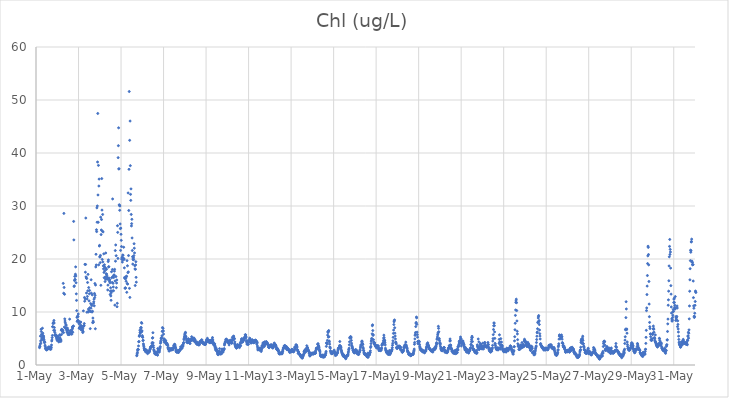
| Category | Chl (ug/L) |
|---|---|
| 44682.166666666664 | 3.27 |
| 44682.177083333336 | 3.56 |
| 44682.1875 | 3.55 |
| 44682.197916666664 | 3.96 |
| 44682.208333333336 | 5.44 |
| 44682.21875 | 4.54 |
| 44682.229166666664 | 4.12 |
| 44682.239583333336 | 6.75 |
| 44682.25 | 6.32 |
| 44682.260416666664 | 5.79 |
| 44682.270833333336 | 4.94 |
| 44682.28125 | 4.76 |
| 44682.291666666664 | 5.26 |
| 44682.302083333336 | 6.94 |
| 44682.3125 | 5.59 |
| 44682.322916666664 | 6.01 |
| 44682.333333333336 | 5.26 |
| 44682.34375 | 5.48 |
| 44682.354166666664 | 5.43 |
| 44682.364583333336 | 5.1 |
| 44682.375 | 4.79 |
| 44682.385416666664 | 4.5 |
| 44682.395833333336 | 4.22 |
| 44682.40625 | 4.32 |
| 44682.416666666664 | 4.3 |
| 44682.427083333336 | 3.72 |
| 44682.4375 | 3.47 |
| 44682.447916666664 | 3.14 |
| 44682.458333333336 | 3.14 |
| 44682.46875 | 2.98 |
| 44682.479166666664 | 2.96 |
| 44682.489583333336 | 3.05 |
| 44682.5 | 2.82 |
| 44682.510416666664 | 3.02 |
| 44682.520833333336 | 2.94 |
| 44682.53125 | 3.08 |
| 44682.541666666664 | 3.06 |
| 44682.552083333336 | 3.14 |
| 44682.5625 | 3.05 |
| 44682.572916666664 | 3.16 |
| 44682.583333333336 | 3.36 |
| 44682.59375 | 3.09 |
| 44682.604166666664 | 3.12 |
| 44682.614583333336 | 3.43 |
| 44682.625 | 3.04 |
| 44682.635416666664 | 3.17 |
| 44682.645833333336 | 3.28 |
| 44682.65625 | 3.15 |
| 44682.666666666664 | 3.34 |
| 44682.677083333336 | 3.04 |
| 44682.6875 | 2.95 |
| 44682.697916666664 | 3.34 |
| 44682.708333333336 | 3.04 |
| 44682.71875 | 3.36 |
| 44682.729166666664 | 3.77 |
| 44682.739583333336 | 4.53 |
| 44682.75 | 4.72 |
| 44682.760416666664 | 5.16 |
| 44682.770833333336 | 5.57 |
| 44682.78125 | 7.23 |
| 44682.791666666664 | 7.21 |
| 44682.802083333336 | 7.83 |
| 44682.8125 | 7.94 |
| 44682.822916666664 | 8.03 |
| 44682.833333333336 | 6.54 |
| 44682.84375 | 8.4 |
| 44682.854166666664 | 7.92 |
| 44682.864583333336 | 7.07 |
| 44682.875 | 6.54 |
| 44682.885416666664 | 6.16 |
| 44682.895833333336 | 5.75 |
| 44682.90625 | 5.6 |
| 44682.916666666664 | 5.53 |
| 44682.927083333336 | 5.58 |
| 44682.9375 | 5.53 |
| 44682.947916666664 | 5.66 |
| 44682.958333333336 | 5.31 |
| 44682.96875 | 5.07 |
| 44682.979166666664 | 4.87 |
| 44682.989583333336 | 5.17 |
| 44683.0 | 4.6 |
| 44683.010416666664 | 5.34 |
| 44683.020833333336 | 5.34 |
| 44683.03125 | 5.22 |
| 44683.041666666664 | 5.42 |
| 44683.052083333336 | 4.84 |
| 44683.0625 | 4.9 |
| 44683.072916666664 | 4.35 |
| 44683.083333333336 | 4.69 |
| 44683.09375 | 4.76 |
| 44683.104166666664 | 4.56 |
| 44683.114583333336 | 5.7 |
| 44683.125 | 5.11 |
| 44683.135416666664 | 4.97 |
| 44683.145833333336 | 5.6 |
| 44683.15625 | 4.77 |
| 44683.166666666664 | 4.44 |
| 44683.177083333336 | 4.69 |
| 44683.1875 | 6.58 |
| 44683.197916666664 | 5.74 |
| 44683.208333333336 | 6.73 |
| 44683.21875 | 6.59 |
| 44683.229166666664 | 6.44 |
| 44683.239583333336 | 6.52 |
| 44683.25 | 6.62 |
| 44683.260416666664 | 6.2 |
| 44683.270833333336 | 6.45 |
| 44683.28125 | 15.4 |
| 44683.291666666664 | 6.1 |
| 44683.302083333336 | 13.54 |
| 44683.3125 | 28.6 |
| 44683.322916666664 | 14.63 |
| 44683.333333333336 | 7.15 |
| 44683.34375 | 13.34 |
| 44683.354166666664 | 8.7 |
| 44683.364583333336 | 8.3 |
| 44683.375 | 7.97 |
| 44683.385416666664 | 7 |
| 44683.395833333336 | 7 |
| 44683.40625 | 7.64 |
| 44683.416666666664 | 7.47 |
| 44683.427083333336 | 6.72 |
| 44683.4375 | 6.97 |
| 44683.447916666664 | 6.57 |
| 44683.458333333336 | 6.25 |
| 44683.46875 | 6.11 |
| 44683.479166666664 | 6.96 |
| 44683.489583333336 | 6.58 |
| 44683.5 | 6.6 |
| 44683.510416666664 | 5.72 |
| 44683.520833333336 | 6.01 |
| 44683.53125 | 6.09 |
| 44683.541666666664 | 5.85 |
| 44683.552083333336 | 5.93 |
| 44683.5625 | 5.76 |
| 44683.572916666664 | 5.83 |
| 44683.583333333336 | 8.65 |
| 44683.59375 | 6.03 |
| 44683.604166666664 | 6.1 |
| 44683.614583333336 | 6.48 |
| 44683.625 | 6.42 |
| 44683.635416666664 | 6.01 |
| 44683.645833333336 | 5.84 |
| 44683.65625 | 5.87 |
| 44683.666666666664 | 6.4 |
| 44683.677083333336 | 6.3 |
| 44683.6875 | 5.83 |
| 44683.697916666664 | 6.65 |
| 44683.708333333336 | 7.16 |
| 44683.71875 | 6.94 |
| 44683.729166666664 | 6.18 |
| 44683.739583333336 | 7.26 |
| 44683.75 | 7.34 |
| 44683.760416666664 | 7.33 |
| 44683.770833333336 | 27.09 |
| 44683.78125 | 23.6 |
| 44683.791666666664 | 14.82 |
| 44683.802083333336 | 14.93 |
| 44683.8125 | 15.94 |
| 44683.822916666664 | 16.72 |
| 44683.833333333336 | 16.16 |
| 44683.84375 | 16.06 |
| 44683.854166666664 | 17.13 |
| 44683.864583333336 | 18.51 |
| 44683.875 | 16.79 |
| 44683.885416666664 | 15.51 |
| 44683.895833333336 | 13.42 |
| 44683.90625 | 12.19 |
| 44683.916666666664 | 10.25 |
| 44683.927083333336 | 8.98 |
| 44683.9375 | 8.21 |
| 44683.947916666664 | 9.19 |
| 44683.958333333336 | 8.34 |
| 44683.96875 | 8.45 |
| 44683.979166666664 | 9.13 |
| 44683.989583333336 | 9.62 |
| 44684.0 | 8.27 |
| 44684.010416666664 | 8.22 |
| 44684.020833333336 | 7.8 |
| 44684.03125 | 6.94 |
| 44684.041666666664 | 6.96 |
| 44684.052083333336 | 6.99 |
| 44684.0625 | 7 |
| 44684.072916666664 | 7.19 |
| 44684.083333333336 | 7.98 |
| 44684.09375 | 7.51 |
| 44684.104166666664 | 8.11 |
| 44684.114583333336 | 7.12 |
| 44684.125 | 6.63 |
| 44684.135416666664 | 7 |
| 44684.145833333336 | 7.37 |
| 44684.15625 | 6.72 |
| 44684.166666666664 | 6.58 |
| 44684.177083333336 | 6.59 |
| 44684.1875 | 6.56 |
| 44684.197916666664 | 6.13 |
| 44684.208333333336 | 6.95 |
| 44684.21875 | 6.27 |
| 44684.229166666664 | 10.21 |
| 44684.239583333336 | 7.3 |
| 44684.25 | 7.4 |
| 44684.260416666664 | 7.43 |
| 44684.270833333336 | 7.82 |
| 44684.28125 | 12.74 |
| 44684.291666666664 | 12.04 |
| 44684.302083333336 | 18.99 |
| 44684.3125 | 12.48 |
| 44684.322916666664 | 17.51 |
| 44684.333333333336 | 18.97 |
| 44684.34375 | 27.73 |
| 44684.354166666664 | 16.63 |
| 44684.364583333336 | 16.42 |
| 44684.375 | 13.58 |
| 44684.385416666664 | 16.32 |
| 44684.395833333336 | 9.96 |
| 44684.40625 | 12.45 |
| 44684.416666666664 | 12.93 |
| 44684.427083333336 | 15.57 |
| 44684.4375 | 14 |
| 44684.447916666664 | 17.1 |
| 44684.458333333336 | 10 |
| 44684.46875 | 10.55 |
| 44684.479166666664 | 14.61 |
| 44684.489583333336 | 10.3 |
| 44684.5 | 12.09 |
| 44684.510416666664 | 13.44 |
| 44684.520833333336 | 14.06 |
| 44684.53125 | 10.81 |
| 44684.541666666664 | 10.13 |
| 44684.552083333336 | 6.86 |
| 44684.5625 | 10.1 |
| 44684.572916666664 | 11.58 |
| 44684.583333333336 | 10.71 |
| 44684.59375 | 16.08 |
| 44684.604166666664 | 13.55 |
| 44684.614583333336 | 11.41 |
| 44684.625 | 11.21 |
| 44684.635416666664 | 9.99 |
| 44684.645833333336 | 13.23 |
| 44684.65625 | 10.14 |
| 44684.666666666664 | 7.99 |
| 44684.677083333336 | 8.86 |
| 44684.6875 | 8.28 |
| 44684.697916666664 | 8.06 |
| 44684.708333333336 | 11.63 |
| 44684.71875 | 11.92 |
| 44684.729166666664 | 12.42 |
| 44684.739583333336 | 11.17 |
| 44684.75 | 13.5 |
| 44684.760416666664 | 12.72 |
| 44684.770833333336 | 15.37 |
| 44684.78125 | 13.15 |
| 44684.791666666664 | 6.84 |
| 44684.802083333336 | 15.09 |
| 44684.8125 | 18.5 |
| 44684.822916666664 | 20.89 |
| 44684.833333333336 | 18.87 |
| 44684.84375 | 25.52 |
| 44684.854166666664 | 25.17 |
| 44684.864583333336 | 29.65 |
| 44684.875 | 26.94 |
| 44684.885416666664 | 30.01 |
| 44684.895833333336 | 38.3 |
| 44684.90625 | 47.46 |
| 44684.916666666664 | 32.08 |
| 44684.927083333336 | 26.93 |
| 44684.9375 | 37.66 |
| 44684.947916666664 | 18.89 |
| 44684.958333333336 | 33.77 |
| 44684.96875 | 35.08 |
| 44684.979166666664 | 22.45 |
| 44684.989583333336 | 22.57 |
| 44685.0 | 20.42 |
| 44685.010416666664 | 20.37 |
| 44685.020833333336 | 19.31 |
| 44685.03125 | 20.68 |
| 44685.041666666664 | 27.89 |
| 44685.052083333336 | 15.04 |
| 44685.0625 | 24.61 |
| 44685.072916666664 | 25.47 |
| 44685.083333333336 | 27.45 |
| 44685.09375 | 35.17 |
| 44685.104166666664 | 29.23 |
| 44685.114583333336 | 19.92 |
| 44685.125 | 25.24 |
| 44685.135416666664 | 28.4 |
| 44685.145833333336 | 19.45 |
| 44685.15625 | 25.11 |
| 44685.166666666664 | 18.7 |
| 44685.177083333336 | 18.14 |
| 44685.1875 | 20.97 |
| 44685.197916666664 | 17.47 |
| 44685.208333333336 | 16.47 |
| 44685.21875 | 18.91 |
| 44685.229166666664 | 18.5 |
| 44685.239583333336 | 17.78 |
| 44685.25 | 15.75 |
| 44685.260416666664 | 16.6 |
| 44685.270833333336 | 16.21 |
| 44685.28125 | 21.13 |
| 44685.291666666664 | 18.23 |
| 44685.302083333336 | 17.21 |
| 44685.3125 | 18.04 |
| 44685.322916666664 | 17.13 |
| 44685.333333333336 | 16.84 |
| 44685.34375 | 16.16 |
| 44685.354166666664 | 16.57 |
| 44685.364583333336 | 16.37 |
| 44685.375 | 14.16 |
| 44685.385416666664 | 15.07 |
| 44685.395833333336 | 19.52 |
| 44685.40625 | 19.82 |
| 44685.416666666664 | 18.5 |
| 44685.427083333336 | 18.55 |
| 44685.4375 | 16.4 |
| 44685.447916666664 | 16.06 |
| 44685.458333333336 | 15.77 |
| 44685.46875 | 16.07 |
| 44685.479166666664 | 15.5 |
| 44685.489583333336 | 13.31 |
| 44685.5 | 13.95 |
| 44685.510416666664 | 14.57 |
| 44685.520833333336 | 13.03 |
| 44685.53125 | 12.21 |
| 44685.541666666664 | 13.63 |
| 44685.552083333336 | 17.6 |
| 44685.5625 | 16.47 |
| 44685.572916666664 | 14 |
| 44685.583333333336 | 15.58 |
| 44685.59375 | 18.02 |
| 44685.604166666664 | 31.33 |
| 44685.614583333336 | 16.7 |
| 44685.625 | 15.41 |
| 44685.635416666664 | 14.72 |
| 44685.645833333336 | 14.01 |
| 44685.65625 | 16.52 |
| 44685.666666666664 | 16.97 |
| 44685.677083333336 | 16.97 |
| 44685.6875 | 17.71 |
| 44685.697916666664 | 18.05 |
| 44685.708333333336 | 11.3 |
| 44685.71875 | 15.85 |
| 44685.729166666664 | 21.59 |
| 44685.739583333336 | 19.59 |
| 44685.75 | 22.65 |
| 44685.760416666664 | 16.69 |
| 44685.770833333336 | 20.62 |
| 44685.78125 | 14.59 |
| 44685.791666666664 | 15.47 |
| 44685.802083333336 | 16.04 |
| 44685.8125 | 11 |
| 44685.822916666664 | 11.64 |
| 44685.833333333336 | 26.28 |
| 44685.84375 | 25.02 |
| 44685.854166666664 | 20.11 |
| 44685.864583333336 | 39.12 |
| 44685.875 | 41.38 |
| 44685.885416666664 | 44.75 |
| 44685.895833333336 | 36.99 |
| 44685.90625 | 37.02 |
| 44685.916666666664 | 30.23 |
| 44685.927083333336 | 30.1 |
| 44685.9375 | 29.19 |
| 44685.947916666664 | 30 |
| 44685.958333333336 | 26.61 |
| 44685.96875 | 25.73 |
| 44685.979166666664 | 21.62 |
| 44685.989583333336 | 25.83 |
| 44686.0 | 24.66 |
| 44686.010416666664 | 23.52 |
| 44686.020833333336 | 22.35 |
| 44686.03125 | 19.97 |
| 44686.041666666664 | 20.2 |
| 44686.052083333336 | 20.36 |
| 44686.0625 | 19.42 |
| 44686.072916666664 | 19.86 |
| 44686.083333333336 | 20.76 |
| 44686.09375 | 20.69 |
| 44686.104166666664 | 20.04 |
| 44686.114583333336 | 20.11 |
| 44686.125 | 22.22 |
| 44686.135416666664 | 19.91 |
| 44686.145833333336 | 20.01 |
| 44686.15625 | 18.33 |
| 44686.166666666664 | 16.52 |
| 44686.177083333336 | 16.34 |
| 44686.1875 | 14.48 |
| 44686.197916666664 | 14.55 |
| 44686.208333333336 | 14.52 |
| 44686.21875 | 16.3 |
| 44686.229166666664 | 16.51 |
| 44686.239583333336 | 15.8 |
| 44686.25 | 16.72 |
| 44686.260416666664 | 16.74 |
| 44686.270833333336 | 13.71 |
| 44686.28125 | 19.69 |
| 44686.291666666664 | 15.37 |
| 44686.302083333336 | 18.72 |
| 44686.3125 | 15.26 |
| 44686.322916666664 | 17.44 |
| 44686.333333333336 | 32.46 |
| 44686.34375 | 17.57 |
| 44686.354166666664 | 20.65 |
| 44686.364583333336 | 29.15 |
| 44686.375 | 36.92 |
| 44686.385416666664 | 51.6 |
| 44686.395833333336 | 14.46 |
| 44686.40625 | 42.39 |
| 44686.416666666664 | 12.75 |
| 44686.427083333336 | 46.03 |
| 44686.4375 | 37.61 |
| 44686.447916666664 | 32.2 |
| 44686.458333333336 | 31.06 |
| 44686.46875 | 33.23 |
| 44686.479166666664 | 28.41 |
| 44686.489583333336 | 26.24 |
| 44686.5 | 26.67 |
| 44686.510416666664 | 27.49 |
| 44686.520833333336 | 23.97 |
| 44686.53125 | 21.6 |
| 44686.541666666664 | 20.44 |
| 44686.552083333336 | 19.04 |
| 44686.5625 | 20.01 |
| 44686.572916666664 | 19.86 |
| 44686.583333333336 | 20.24 |
| 44686.59375 | 19.9 |
| 44686.604166666664 | 20.63 |
| 44686.614583333336 | 22.88 |
| 44686.625 | 22.04 |
| 44686.635416666664 | 21.15 |
| 44686.645833333336 | 18.74 |
| 44686.65625 | 18.13 |
| 44686.666666666664 | 15 |
| 44686.677083333336 | 18.05 |
| 44686.6875 | 18.88 |
| 44686.697916666664 | 19.49 |
| 44686.708333333336 | 16.54 |
| 44686.71875 | 15.63 |
| 44686.739583333336 | 1.74 |
| 44686.75 | 1.88 |
| 44686.760416666664 | 2.13 |
| 44686.770833333336 | 2.38 |
| 44686.78125 | 2.75 |
| 44686.791666666664 | 2.97 |
| 44686.802083333336 | 2.91 |
| 44686.8125 | 2.92 |
| 44686.822916666664 | 3.6 |
| 44686.833333333336 | 4.38 |
| 44686.84375 | 4.42 |
| 44686.854166666664 | 5.46 |
| 44686.864583333336 | 5.43 |
| 44686.875 | 5.64 |
| 44686.885416666664 | 6.57 |
| 44686.895833333336 | 6.11 |
| 44686.90625 | 6.04 |
| 44686.916666666664 | 6.27 |
| 44686.927083333336 | 7.04 |
| 44686.9375 | 6.83 |
| 44686.947916666664 | 7.08 |
| 44686.958333333336 | 8.01 |
| 44686.96875 | 6.25 |
| 44686.979166666664 | 7.87 |
| 44686.989583333336 | 6.43 |
| 44687.0 | 5.55 |
| 44687.010416666664 | 5.26 |
| 44687.020833333336 | 5.24 |
| 44687.03125 | 4.6 |
| 44687.041666666664 | 4.68 |
| 44687.052083333336 | 3.99 |
| 44687.0625 | 3.74 |
| 44687.072916666664 | 3.47 |
| 44687.083333333336 | 3.19 |
| 44687.09375 | 3.03 |
| 44687.104166666664 | 2.78 |
| 44687.114583333336 | 2.96 |
| 44687.125 | 2.87 |
| 44687.135416666664 | 2.73 |
| 44687.145833333336 | 2.93 |
| 44687.15625 | 2.47 |
| 44687.166666666664 | 2.65 |
| 44687.177083333336 | 2.7 |
| 44687.1875 | 2.74 |
| 44687.197916666664 | 2.81 |
| 44687.208333333336 | 2.64 |
| 44687.21875 | 2.44 |
| 44687.229166666664 | 2.37 |
| 44687.239583333336 | 2.55 |
| 44687.25 | 2.14 |
| 44687.260416666664 | 2.36 |
| 44687.270833333336 | 2.44 |
| 44687.28125 | 2.4 |
| 44687.291666666664 | 2.55 |
| 44687.302083333336 | 2.4 |
| 44687.3125 | 2.4 |
| 44687.322916666664 | 2.47 |
| 44687.333333333336 | 2.6 |
| 44687.34375 | 2.65 |
| 44687.354166666664 | 2.89 |
| 44687.364583333336 | 3.02 |
| 44687.375 | 3.05 |
| 44687.385416666664 | 3.29 |
| 44687.395833333336 | 3.42 |
| 44687.40625 | 3.45 |
| 44687.416666666664 | 3.42 |
| 44687.427083333336 | 3.43 |
| 44687.4375 | 3.51 |
| 44687.447916666664 | 3.59 |
| 44687.458333333336 | 4.03 |
| 44687.46875 | 4.23 |
| 44687.479166666664 | 5.07 |
| 44687.489583333336 | 5.16 |
| 44687.5 | 6.09 |
| 44687.510416666664 | 4.17 |
| 44687.520833333336 | 3.67 |
| 44687.53125 | 3.3 |
| 44687.541666666664 | 2.88 |
| 44687.552083333336 | 2.72 |
| 44687.5625 | 2.62 |
| 44687.572916666664 | 2.48 |
| 44687.583333333336 | 2.22 |
| 44687.59375 | 2.16 |
| 44687.604166666664 | 2.1 |
| 44687.614583333336 | 2.03 |
| 44687.625 | 2.08 |
| 44687.635416666664 | 2.27 |
| 44687.645833333336 | 2.4 |
| 44687.65625 | 2.27 |
| 44687.666666666664 | 2 |
| 44687.677083333336 | 2.27 |
| 44687.6875 | 2.07 |
| 44687.697916666664 | 2.26 |
| 44687.708333333336 | 1.92 |
| 44687.71875 | 1.86 |
| 44687.729166666664 | 3.1 |
| 44687.739583333336 | 2.78 |
| 44687.75 | 2.45 |
| 44687.760416666664 | 2.57 |
| 44687.770833333336 | 2.94 |
| 44687.78125 | 2.73 |
| 44687.791666666664 | 2.44 |
| 44687.802083333336 | 2.49 |
| 44687.8125 | 2.84 |
| 44687.822916666664 | 3.14 |
| 44687.833333333336 | 3.27 |
| 44687.84375 | 3.48 |
| 44687.854166666664 | 4.11 |
| 44687.864583333336 | 4.52 |
| 44687.875 | 4.33 |
| 44687.885416666664 | 4.96 |
| 44687.895833333336 | 5.13 |
| 44687.90625 | 4.99 |
| 44687.916666666664 | 5.04 |
| 44687.927083333336 | 5.52 |
| 44687.9375 | 6.34 |
| 44687.947916666664 | 7.06 |
| 44687.958333333336 | 6.37 |
| 44687.96875 | 6.38 |
| 44687.979166666664 | 6.92 |
| 44687.989583333336 | 6.43 |
| 44688.0 | 5.83 |
| 44688.010416666664 | 4.6 |
| 44688.020833333336 | 4.96 |
| 44688.03125 | 4.67 |
| 44688.041666666664 | 4.29 |
| 44688.052083333336 | 4.55 |
| 44688.0625 | 4.76 |
| 44688.072916666664 | 4.63 |
| 44688.083333333336 | 4.38 |
| 44688.09375 | 4.24 |
| 44688.104166666664 | 4.57 |
| 44688.114583333336 | 4.28 |
| 44688.125 | 4.12 |
| 44688.135416666664 | 3.87 |
| 44688.145833333336 | 4.03 |
| 44688.15625 | 3.95 |
| 44688.166666666664 | 4.07 |
| 44688.177083333336 | 3.85 |
| 44688.1875 | 3.81 |
| 44688.197916666664 | 3.65 |
| 44688.208333333336 | 3.28 |
| 44688.21875 | 3.05 |
| 44688.229166666664 | 3.14 |
| 44688.239583333336 | 2.92 |
| 44688.25 | 3.11 |
| 44688.260416666664 | 2.61 |
| 44688.270833333336 | 2.72 |
| 44688.28125 | 3.16 |
| 44688.291666666664 | 2.89 |
| 44688.302083333336 | 3.02 |
| 44688.3125 | 2.96 |
| 44688.322916666664 | 2.81 |
| 44688.333333333336 | 2.99 |
| 44688.34375 | 3.01 |
| 44688.354166666664 | 2.96 |
| 44688.364583333336 | 2.84 |
| 44688.375 | 3.01 |
| 44688.385416666664 | 3.1 |
| 44688.395833333336 | 2.86 |
| 44688.40625 | 2.95 |
| 44688.416666666664 | 3.11 |
| 44688.427083333336 | 3.1 |
| 44688.4375 | 2.89 |
| 44688.447916666664 | 3.11 |
| 44688.458333333336 | 3.07 |
| 44688.46875 | 3.3 |
| 44688.479166666664 | 3.57 |
| 44688.489583333336 | 3.73 |
| 44688.5 | 3.74 |
| 44688.510416666664 | 3.83 |
| 44688.520833333336 | 3.91 |
| 44688.53125 | 3.86 |
| 44688.541666666664 | 3.64 |
| 44688.552083333336 | 3.41 |
| 44688.5625 | 3.29 |
| 44688.572916666664 | 3.08 |
| 44688.583333333336 | 2.74 |
| 44688.59375 | 2.55 |
| 44688.604166666664 | 2.5 |
| 44688.614583333336 | 2.57 |
| 44688.625 | 2.39 |
| 44688.635416666664 | 2.66 |
| 44688.645833333336 | 2.68 |
| 44688.65625 | 2.68 |
| 44688.666666666664 | 2.49 |
| 44688.677083333336 | 2.4 |
| 44688.6875 | 2.49 |
| 44688.697916666664 | 2.41 |
| 44688.708333333336 | 2.37 |
| 44688.71875 | 2.52 |
| 44688.729166666664 | 2.74 |
| 44688.739583333336 | 2.69 |
| 44688.75 | 2.88 |
| 44688.760416666664 | 2.72 |
| 44688.770833333336 | 2.91 |
| 44688.78125 | 2.8 |
| 44688.791666666664 | 2.94 |
| 44688.802083333336 | 3.43 |
| 44688.8125 | 3.15 |
| 44688.822916666664 | 3.2 |
| 44688.833333333336 | 3.09 |
| 44688.84375 | 3.21 |
| 44688.854166666664 | 3.2 |
| 44688.864583333336 | 3.14 |
| 44688.875 | 3.27 |
| 44688.885416666664 | 3.75 |
| 44688.895833333336 | 3.64 |
| 44688.90625 | 3.6 |
| 44688.916666666664 | 3.58 |
| 44688.927083333336 | 3.95 |
| 44688.9375 | 4.16 |
| 44688.947916666664 | 4.24 |
| 44688.958333333336 | 4.79 |
| 44688.96875 | 4.98 |
| 44688.979166666664 | 5.26 |
| 44688.989583333336 | 5.46 |
| 44689.0 | 5.78 |
| 44689.010416666664 | 5.96 |
| 44689.020833333336 | 6.05 |
| 44689.03125 | 6.16 |
| 44689.041666666664 | 5.45 |
| 44689.052083333336 | 5.33 |
| 44689.0625 | 5.01 |
| 44689.072916666664 | 5.01 |
| 44689.083333333336 | 4.69 |
| 44689.09375 | 4.28 |
| 44689.104166666664 | 4.37 |
| 44689.114583333336 | 4.39 |
| 44689.125 | 4.28 |
| 44689.135416666664 | 4.21 |
| 44689.145833333336 | 4.3 |
| 44689.15625 | 4.53 |
| 44689.166666666664 | 4.94 |
| 44689.177083333336 | 4.88 |
| 44689.1875 | 4.56 |
| 44689.197916666664 | 4.4 |
| 44689.208333333336 | 4.21 |
| 44689.21875 | 4.23 |
| 44689.229166666664 | 4.12 |
| 44689.239583333336 | 4.36 |
| 44689.25 | 4.05 |
| 44689.260416666664 | 4.55 |
| 44689.270833333336 | 4.82 |
| 44689.28125 | 4.56 |
| 44689.291666666664 | 4.69 |
| 44689.302083333336 | 4.79 |
| 44689.3125 | 4.96 |
| 44689.322916666664 | 5.34 |
| 44689.333333333336 | 5.05 |
| 44689.34375 | 4.83 |
| 44689.354166666664 | 4.98 |
| 44689.364583333336 | 5.01 |
| 44689.375 | 4.76 |
| 44689.385416666664 | 4.84 |
| 44689.395833333336 | 4.61 |
| 44689.40625 | 4.85 |
| 44689.416666666664 | 4.85 |
| 44689.427083333336 | 5.1 |
| 44689.4375 | 4.98 |
| 44689.447916666664 | 4.59 |
| 44689.458333333336 | 4.51 |
| 44689.46875 | 4.38 |
| 44689.479166666664 | 4.8 |
| 44689.489583333336 | 4.52 |
| 44689.5 | 4.27 |
| 44689.510416666664 | 4.39 |
| 44689.520833333336 | 4.4 |
| 44689.53125 | 4.32 |
| 44689.541666666664 | 4.18 |
| 44689.552083333336 | 4.03 |
| 44689.5625 | 3.91 |
| 44689.572916666664 | 4.1 |
| 44689.583333333336 | 4.3 |
| 44689.59375 | 4.05 |
| 44689.604166666664 | 3.98 |
| 44689.614583333336 | 3.89 |
| 44689.625 | 4.01 |
| 44689.635416666664 | 3.95 |
| 44689.645833333336 | 3.78 |
| 44689.65625 | 3.91 |
| 44689.666666666664 | 3.91 |
| 44689.677083333336 | 3.8 |
| 44689.6875 | 3.87 |
| 44689.697916666664 | 4.26 |
| 44689.708333333336 | 4.44 |
| 44689.71875 | 4.38 |
| 44689.729166666664 | 4.3 |
| 44689.739583333336 | 4.44 |
| 44689.75 | 4.44 |
| 44689.760416666664 | 4.34 |
| 44689.770833333336 | 4.32 |
| 44689.78125 | 4.71 |
| 44689.791666666664 | 4.41 |
| 44689.802083333336 | 4.75 |
| 44689.8125 | 4.34 |
| 44689.822916666664 | 4.24 |
| 44689.833333333336 | 4.24 |
| 44689.84375 | 4.12 |
| 44689.854166666664 | 4.25 |
| 44689.864583333336 | 4.33 |
| 44689.875 | 4.06 |
| 44689.885416666664 | 4.13 |
| 44689.895833333336 | 3.94 |
| 44689.90625 | 3.97 |
| 44689.916666666664 | 3.95 |
| 44689.927083333336 | 3.98 |
| 44689.9375 | 3.98 |
| 44689.947916666664 | 3.89 |
| 44689.958333333336 | 3.89 |
| 44689.96875 | 3.86 |
| 44689.979166666664 | 3.97 |
| 44689.989583333336 | 4.21 |
| 44690.0 | 4.35 |
| 44690.010416666664 | 4.5 |
| 44690.020833333336 | 4.78 |
| 44690.03125 | 4.51 |
| 44690.041666666664 | 4.34 |
| 44690.052083333336 | 4.53 |
| 44690.0625 | 5.04 |
| 44690.072916666664 | 4.8 |
| 44690.083333333336 | 4.61 |
| 44690.09375 | 4.61 |
| 44690.104166666664 | 4.41 |
| 44690.114583333336 | 4.58 |
| 44690.125 | 4.42 |
| 44690.135416666664 | 4.63 |
| 44690.145833333336 | 4.58 |
| 44690.15625 | 4.24 |
| 44690.166666666664 | 4.55 |
| 44690.177083333336 | 4.21 |
| 44690.1875 | 4.65 |
| 44690.197916666664 | 4.64 |
| 44690.208333333336 | 4.23 |
| 44690.21875 | 4.32 |
| 44690.229166666664 | 4.35 |
| 44690.239583333336 | 4.37 |
| 44690.25 | 4.24 |
| 44690.260416666664 | 4.27 |
| 44690.270833333336 | 4.52 |
| 44690.28125 | 4.58 |
| 44690.291666666664 | 4.86 |
| 44690.302083333336 | 5.18 |
| 44690.3125 | 4.76 |
| 44690.322916666664 | 4.5 |
| 44690.333333333336 | 3.98 |
| 44690.34375 | 4.19 |
| 44690.354166666664 | 4.15 |
| 44690.364583333336 | 3.88 |
| 44690.375 | 3.7 |
| 44690.385416666664 | 3.8 |
| 44690.395833333336 | 3.94 |
| 44690.40625 | 3.99 |
| 44690.416666666664 | 3.64 |
| 44690.427083333336 | 3.34 |
| 44690.4375 | 3.12 |
| 44690.447916666664 | 2.85 |
| 44690.458333333336 | 3.31 |
| 44690.46875 | 2.82 |
| 44690.479166666664 | 2.88 |
| 44690.489583333336 | 2.91 |
| 44690.5 | 2.95 |
| 44690.510416666664 | 2.6 |
| 44690.520833333336 | 2.56 |
| 44690.53125 | 2.43 |
| 44690.541666666664 | 2.2 |
| 44690.552083333336 | 1.98 |
| 44690.5625 | 2.25 |
| 44690.572916666664 | 1.95 |
| 44690.583333333336 | 2.17 |
| 44690.59375 | 2.54 |
| 44690.604166666664 | 2.55 |
| 44690.614583333336 | 2.34 |
| 44690.625 | 2.44 |
| 44690.635416666664 | 3.09 |
| 44690.645833333336 | 2.5 |
| 44690.65625 | 2.09 |
| 44690.666666666664 | 2.06 |
| 44690.677083333336 | 2.25 |
| 44690.6875 | 2.28 |
| 44690.697916666664 | 2.12 |
| 44690.708333333336 | 2.12 |
| 44690.71875 | 2.46 |
| 44690.729166666664 | 2.14 |
| 44690.739583333336 | 2.66 |
| 44690.75 | 3.02 |
| 44690.760416666664 | 2.94 |
| 44690.770833333336 | 2.77 |
| 44690.78125 | 2.61 |
| 44690.791666666664 | 2.62 |
| 44690.802083333336 | 2.44 |
| 44690.8125 | 2.8 |
| 44690.822916666664 | 2.79 |
| 44690.833333333336 | 2.95 |
| 44690.84375 | 2.96 |
| 44690.854166666664 | 3.1 |
| 44690.864583333336 | 3.76 |
| 44690.875 | 3.98 |
| 44690.885416666664 | 4.03 |
| 44690.895833333336 | 4.27 |
| 44690.90625 | 4.38 |
| 44690.916666666664 | 4.42 |
| 44690.927083333336 | 4.74 |
| 44690.9375 | 4.87 |
| 44690.947916666664 | 4.67 |
| 44690.958333333336 | 4.88 |
| 44690.96875 | 4.75 |
| 44690.979166666664 | 4.73 |
| 44690.989583333336 | 4.57 |
| 44691.0 | 4.53 |
| 44691.010416666664 | 4.62 |
| 44691.020833333336 | 4.35 |
| 44691.03125 | 4.29 |
| 44691.041666666664 | 4.52 |
| 44691.052083333336 | 4.15 |
| 44691.0625 | 4.34 |
| 44691.072916666664 | 4.5 |
| 44691.083333333336 | 3.79 |
| 44691.09375 | 4.31 |
| 44691.104166666664 | 4.14 |
| 44691.114583333336 | 4.18 |
| 44691.125 | 4.52 |
| 44691.135416666664 | 4.69 |
| 44691.145833333336 | 4.49 |
| 44691.15625 | 4.5 |
| 44691.166666666664 | 4.4 |
| 44691.177083333336 | 4.39 |
| 44691.1875 | 4.21 |
| 44691.197916666664 | 4.15 |
| 44691.208333333336 | 4.11 |
| 44691.21875 | 4.23 |
| 44691.229166666664 | 4.81 |
| 44691.239583333336 | 5.21 |
| 44691.25 | 4.8 |
| 44691.260416666664 | 4.67 |
| 44691.270833333336 | 5.1 |
| 44691.28125 | 5.39 |
| 44691.291666666664 | 4.99 |
| 44691.302083333336 | 5.45 |
| 44691.3125 | 4.83 |
| 44691.322916666664 | 5.04 |
| 44691.333333333336 | 4.97 |
| 44691.34375 | 4.01 |
| 44691.354166666664 | 4.35 |
| 44691.364583333336 | 3.93 |
| 44691.375 | 3.66 |
| 44691.385416666664 | 3.52 |
| 44691.395833333336 | 3.37 |
| 44691.40625 | 3.47 |
| 44691.416666666664 | 3.26 |
| 44691.427083333336 | 3.17 |
| 44691.4375 | 3.29 |
| 44691.447916666664 | 3.25 |
| 44691.458333333336 | 3.34 |
| 44691.46875 | 3.84 |
| 44691.479166666664 | 3.42 |
| 44691.489583333336 | 3.77 |
| 44691.5 | 3.51 |
| 44691.510416666664 | 3.72 |
| 44691.520833333336 | 3.47 |
| 44691.53125 | 3.58 |
| 44691.541666666664 | 3.47 |
| 44691.552083333336 | 3.78 |
| 44691.5625 | 3.77 |
| 44691.572916666664 | 3.28 |
| 44691.583333333336 | 3.82 |
| 44691.59375 | 3.74 |
| 44691.604166666664 | 3.57 |
| 44691.614583333336 | 4.21 |
| 44691.625 | 3.65 |
| 44691.635416666664 | 4.33 |
| 44691.645833333336 | 4.15 |
| 44691.65625 | 4.54 |
| 44691.666666666664 | 4.89 |
| 44691.677083333336 | 4.75 |
| 44691.6875 | 4.97 |
| 44691.697916666664 | 4.59 |
| 44691.708333333336 | 4.32 |
| 44691.71875 | 4.86 |
| 44691.729166666664 | 4.37 |
| 44691.739583333336 | 4.68 |
| 44691.75 | 4.7 |
| 44691.760416666664 | 4.61 |
| 44691.770833333336 | 4.85 |
| 44691.78125 | 4.97 |
| 44691.791666666664 | 5.02 |
| 44691.802083333336 | 4.86 |
| 44691.8125 | 5.27 |
| 44691.822916666664 | 5.08 |
| 44691.833333333336 | 5.15 |
| 44691.84375 | 5.72 |
| 44691.854166666664 | 5.48 |
| 44691.864583333336 | 5.69 |
| 44691.875 | 5.12 |
| 44691.885416666664 | 5.3 |
| 44691.895833333336 | 4.45 |
| 44691.90625 | 4.6 |
| 44691.916666666664 | 4.18 |
| 44691.927083333336 | 3.91 |
| 44691.9375 | 4.14 |
| 44691.947916666664 | 4.41 |
| 44691.958333333336 | 4.07 |
| 44691.96875 | 3.88 |
| 44691.979166666664 | 4.61 |
| 44691.989583333336 | 3.91 |
| 44692.0 | 4.43 |
| 44692.010416666664 | 4.36 |
| 44692.020833333336 | 4.45 |
| 44692.03125 | 4.61 |
| 44692.041666666664 | 4.62 |
| 44692.052083333336 | 5.07 |
| 44692.0625 | 4.88 |
| 44692.072916666664 | 4.92 |
| 44692.083333333336 | 4.7 |
| 44692.09375 | 4.35 |
| 44692.104166666664 | 4.18 |
| 44692.114583333336 | 4.19 |
| 44692.125 | 4.21 |
| 44692.135416666664 | 4.19 |
| 44692.145833333336 | 4.35 |
| 44692.15625 | 4.65 |
| 44692.166666666664 | 4.75 |
| 44692.177083333336 | 4.73 |
| 44692.1875 | 4.62 |
| 44692.197916666664 | 4.37 |
| 44692.208333333336 | 4.58 |
| 44692.21875 | 4.27 |
| 44692.229166666664 | 4.4 |
| 44692.239583333336 | 4.2 |
| 44692.25 | 4.24 |
| 44692.260416666664 | 4.46 |
| 44692.270833333336 | 4.47 |
| 44692.28125 | 4.63 |
| 44692.291666666664 | 4.33 |
| 44692.302083333336 | 4.34 |
| 44692.3125 | 4.59 |
| 44692.322916666664 | 4.66 |
| 44692.333333333336 | 4.68 |
| 44692.34375 | 4.61 |
| 44692.354166666664 | 4.42 |
| 44692.364583333336 | 4.4 |
| 44692.375 | 4.46 |
| 44692.385416666664 | 3.94 |
| 44692.395833333336 | 4.1 |
| 44692.40625 | 4.29 |
| 44692.416666666664 | 3.57 |
| 44692.427083333336 | 3.24 |
| 44692.4375 | 2.84 |
| 44692.447916666664 | 2.88 |
| 44692.458333333336 | 3.11 |
| 44692.46875 | 3.14 |
| 44692.479166666664 | 3.03 |
| 44692.489583333336 | 2.91 |
| 44692.5 | 3.03 |
| 44692.510416666664 | 2.85 |
| 44692.520833333336 | 2.85 |
| 44692.53125 | 3.2 |
| 44692.541666666664 | 2.92 |
| 44692.552083333336 | 2.89 |
| 44692.5625 | 3.01 |
| 44692.572916666664 | 3.04 |
| 44692.583333333336 | 2.87 |
| 44692.59375 | 2.55 |
| 44692.604166666664 | 2.81 |
| 44692.614583333336 | 3.05 |
| 44692.625 | 3.58 |
| 44692.635416666664 | 3.41 |
| 44692.645833333336 | 3.7 |
| 44692.65625 | 3.24 |
| 44692.666666666664 | 3.62 |
| 44692.677083333336 | 4.07 |
| 44692.6875 | 4.2 |
| 44692.697916666664 | 4.19 |
| 44692.708333333336 | 3.89 |
| 44692.71875 | 3.92 |
| 44692.729166666664 | 3.89 |
| 44692.739583333336 | 3.48 |
| 44692.75 | 3.66 |
| 44692.760416666664 | 4.35 |
| 44692.770833333336 | 4.32 |
| 44692.78125 | 4.33 |
| 44692.791666666664 | 4.11 |
| 44692.802083333336 | 3.91 |
| 44692.8125 | 4.05 |
| 44692.822916666664 | 4.23 |
| 44692.833333333336 | 4.38 |
| 44692.84375 | 4.39 |
| 44692.854166666664 | 4.12 |
| 44692.864583333336 | 4.03 |
| 44692.875 | 4.03 |
| 44692.885416666664 | 3.89 |
| 44692.895833333336 | 4.12 |
| 44692.90625 | 3.91 |
| 44692.916666666664 | 3.89 |
| 44692.927083333336 | 3.73 |
| 44692.9375 | 3.42 |
| 44692.947916666664 | 3.35 |
| 44692.958333333336 | 3.3 |
| 44692.96875 | 3.26 |
| 44692.979166666664 | 3.47 |
| 44692.989583333336 | 3.54 |
| 44693.0 | 3.55 |
| 44693.010416666664 | 3.72 |
| 44693.020833333336 | 3.63 |
| 44693.03125 | 3.77 |
| 44693.041666666664 | 3.68 |
| 44693.052083333336 | 3.78 |
| 44693.0625 | 3.52 |
| 44693.072916666664 | 3.44 |
| 44693.083333333336 | 3.42 |
| 44693.09375 | 3.84 |
| 44693.104166666664 | 3.51 |
| 44693.114583333336 | 3.41 |
| 44693.125 | 3.34 |
| 44693.135416666664 | 3.19 |
| 44693.145833333336 | 3.28 |
| 44693.15625 | 3.26 |
| 44693.166666666664 | 3.55 |
| 44693.177083333336 | 3.7 |
| 44693.1875 | 3.75 |
| 44693.197916666664 | 3.58 |
| 44693.208333333336 | 4.15 |
| 44693.21875 | 3.81 |
| 44693.229166666664 | 3.76 |
| 44693.239583333336 | 3.95 |
| 44693.25 | 3.72 |
| 44693.260416666664 | 3.63 |
| 44693.270833333336 | 3.77 |
| 44693.28125 | 3.7 |
| 44693.291666666664 | 3.51 |
| 44693.302083333336 | 3.33 |
| 44693.3125 | 3.05 |
| 44693.322916666664 | 2.95 |
| 44693.333333333336 | 2.98 |
| 44693.34375 | 2.99 |
| 44693.354166666664 | 3.12 |
| 44693.364583333336 | 3.06 |
| 44693.375 | 2.73 |
| 44693.385416666664 | 2.77 |
| 44693.395833333336 | 2.64 |
| 44693.40625 | 2.8 |
| 44693.416666666664 | 2.47 |
| 44693.427083333336 | 2.24 |
| 44693.4375 | 2.12 |
| 44693.447916666664 | 2.08 |
| 44693.458333333336 | 2.15 |
| 44693.46875 | 2.16 |
| 44693.479166666664 | 2.14 |
| 44693.489583333336 | 2.09 |
| 44693.5 | 2.22 |
| 44693.510416666664 | 2.18 |
| 44693.520833333336 | 2.18 |
| 44693.53125 | 2.34 |
| 44693.541666666664 | 2.28 |
| 44693.552083333336 | 2.29 |
| 44693.5625 | 2.1 |
| 44693.572916666664 | 2.35 |
| 44693.583333333336 | 2.14 |
| 44693.59375 | 2.59 |
| 44693.604166666664 | 2.5 |
| 44693.614583333336 | 2.84 |
| 44693.625 | 3 |
| 44693.635416666664 | 3.24 |
| 44693.645833333336 | 3.17 |
| 44693.65625 | 3.32 |
| 44693.666666666664 | 3.36 |
| 44693.677083333336 | 3.61 |
| 44693.6875 | 3.55 |
| 44693.697916666664 | 3.57 |
| 44693.708333333336 | 3.69 |
| 44693.71875 | 3.54 |
| 44693.729166666664 | 3.31 |
| 44693.739583333336 | 3.49 |
| 44693.75 | 3.2 |
| 44693.760416666664 | 3.5 |
| 44693.770833333336 | 3.17 |
| 44693.78125 | 3.43 |
| 44693.791666666664 | 3.42 |
| 44693.802083333336 | 2.91 |
| 44693.8125 | 2.97 |
| 44693.822916666664 | 2.95 |
| 44693.833333333336 | 3.1 |
| 44693.84375 | 3.17 |
| 44693.854166666664 | 3.08 |
| 44693.864583333336 | 3 |
| 44693.875 | 2.96 |
| 44693.885416666664 | 2.75 |
| 44693.895833333336 | 2.88 |
| 44693.90625 | 2.76 |
| 44693.916666666664 | 2.57 |
| 44693.927083333336 | 2.7 |
| 44693.9375 | 2.36 |
| 44693.947916666664 | 2.44 |
| 44693.958333333336 | 2.53 |
| 44693.96875 | 2.64 |
| 44693.979166666664 | 2.58 |
| 44693.989583333336 | 2.49 |
| 44694.0 | 2.5 |
| 44694.010416666664 | 2.51 |
| 44694.020833333336 | 2.73 |
| 44694.03125 | 2.95 |
| 44694.041666666664 | 2.95 |
| 44694.052083333336 | 2.76 |
| 44694.0625 | 2.69 |
| 44694.072916666664 | 2.84 |
| 44694.083333333336 | 2.56 |
| 44694.09375 | 2.63 |
| 44694.104166666664 | 2.52 |
| 44694.114583333336 | 2.48 |
| 44694.125 | 2.72 |
| 44694.135416666664 | 2.83 |
| 44694.145833333336 | 2.64 |
| 44694.15625 | 2.88 |
| 44694.166666666664 | 3.37 |
| 44694.177083333336 | 3.11 |
| 44694.1875 | 3.3 |
| 44694.197916666664 | 3.05 |
| 44694.208333333336 | 3.32 |
| 44694.21875 | 3.51 |
| 44694.229166666664 | 3.83 |
| 44694.239583333336 | 3.72 |
| 44694.25 | 3.52 |
| 44694.260416666664 | 3.73 |
| 44694.270833333336 | 3.53 |
| 44694.28125 | 3.36 |
| 44694.291666666664 | 2.9 |
| 44694.302083333336 | 2.87 |
| 44694.3125 | 2.69 |
| 44694.322916666664 | 2.54 |
| 44694.333333333336 | 2.17 |
| 44694.34375 | 2.45 |
| 44694.354166666664 | 2.45 |
| 44694.364583333336 | 2.22 |
| 44694.375 | 2.16 |
| 44694.385416666664 | 2.11 |
| 44694.395833333336 | 1.92 |
| 44694.40625 | 2.04 |
| 44694.416666666664 | 2.03 |
| 44694.427083333336 | 1.91 |
| 44694.4375 | 1.91 |
| 44694.447916666664 | 1.58 |
| 44694.458333333336 | 1.66 |
| 44694.46875 | 1.68 |
| 44694.479166666664 | 1.56 |
| 44694.489583333336 | 1.63 |
| 44694.5 | 1.42 |
| 44694.510416666664 | 1.33 |
| 44694.520833333336 | 1.39 |
| 44694.53125 | 1.3 |
| 44694.541666666664 | 1.49 |
| 44694.552083333336 | 1.73 |
| 44694.5625 | 1.64 |
| 44694.572916666664 | 1.9 |
| 44694.583333333336 | 1.93 |
| 44694.59375 | 2.04 |
| 44694.604166666664 | 2.48 |
| 44694.614583333336 | 2.23 |
| 44694.625 | 2.6 |
| 44694.635416666664 | 2.67 |
| 44694.645833333336 | 2.72 |
| 44694.65625 | 2.86 |
| 44694.666666666664 | 2.58 |
| 44694.677083333336 | 2.4 |
| 44694.6875 | 2.64 |
| 44694.697916666664 | 2.83 |
| 44694.708333333336 | 3.08 |
| 44694.71875 | 2.89 |
| 44694.729166666664 | 2.75 |
| 44694.739583333336 | 3.63 |
| 44694.75 | 3.23 |
| 44694.760416666664 | 3.29 |
| 44694.770833333336 | 3.31 |
| 44694.78125 | 3.19 |
| 44694.791666666664 | 2.89 |
| 44694.802083333336 | 2.77 |
| 44694.8125 | 2.79 |
| 44694.822916666664 | 2.56 |
| 44694.833333333336 | 2.61 |
| 44694.84375 | 2.5 |
| 44694.854166666664 | 2.2 |
| 44694.864583333336 | 2.1 |
| 44694.875 | 1.8 |
| 44694.885416666664 | 1.68 |
| 44694.895833333336 | 1.86 |
| 44694.90625 | 1.85 |
| 44694.916666666664 | 1.98 |
| 44694.927083333336 | 2.2 |
| 44694.9375 | 2.21 |
| 44694.947916666664 | 2.22 |
| 44694.958333333336 | 2.15 |
| 44694.96875 | 2.12 |
| 44694.979166666664 | 2.06 |
| 44694.989583333336 | 2.21 |
| 44695.0 | 2.16 |
| 44695.010416666664 | 2.18 |
| 44695.020833333336 | 2.25 |
| 44695.03125 | 2.02 |
| 44695.041666666664 | 2.21 |
| 44695.052083333336 | 2.26 |
| 44695.0625 | 2.13 |
| 44695.072916666664 | 2.22 |
| 44695.083333333336 | 2.27 |
| 44695.09375 | 2.16 |
| 44695.104166666664 | 2.17 |
| 44695.114583333336 | 2.22 |
| 44695.125 | 2.2 |
| 44695.135416666664 | 2.23 |
| 44695.145833333336 | 2.57 |
| 44695.15625 | 2.27 |
| 44695.166666666664 | 2.74 |
| 44695.177083333336 | 3.01 |
| 44695.1875 | 3.19 |
| 44695.197916666664 | 3.17 |
| 44695.208333333336 | 3.04 |
| 44695.21875 | 3.17 |
| 44695.229166666664 | 3.14 |
| 44695.239583333336 | 3.15 |
| 44695.25 | 3.92 |
| 44695.260416666664 | 3.9 |
| 44695.270833333336 | 4.03 |
| 44695.28125 | 3.59 |
| 44695.291666666664 | 3.6 |
| 44695.302083333336 | 3.53 |
| 44695.3125 | 3.31 |
| 44695.322916666664 | 3.01 |
| 44695.333333333336 | 2.8 |
| 44695.34375 | 2.72 |
| 44695.354166666664 | 2.55 |
| 44695.364583333336 | 2.26 |
| 44695.375 | 1.91 |
| 44695.385416666664 | 1.74 |
| 44695.395833333336 | 1.73 |
| 44695.40625 | 1.69 |
| 44695.416666666664 | 1.57 |
| 44695.427083333336 | 1.79 |
| 44695.4375 | 1.69 |
| 44695.447916666664 | 1.68 |
| 44695.458333333336 | 1.81 |
| 44695.46875 | 1.87 |
| 44695.479166666664 | 1.68 |
| 44695.489583333336 | 1.69 |
| 44695.5 | 1.59 |
| 44695.510416666664 | 1.44 |
| 44695.520833333336 | 1.84 |
| 44695.53125 | 1.6 |
| 44695.541666666664 | 1.64 |
| 44695.552083333336 | 1.73 |
| 44695.5625 | 1.56 |
| 44695.572916666664 | 1.56 |
| 44695.583333333336 | 1.7 |
| 44695.59375 | 1.82 |
| 44695.604166666664 | 1.83 |
| 44695.614583333336 | 1.88 |
| 44695.625 | 2.15 |
| 44695.635416666664 | 2.29 |
| 44695.645833333336 | 2.56 |
| 44695.65625 | 3.51 |
| 44695.666666666664 | 4.19 |
| 44695.677083333336 | 4.07 |
| 44695.6875 | 4.13 |
| 44695.697916666664 | 3.97 |
| 44695.708333333336 | 4.65 |
| 44695.71875 | 5.64 |
| 44695.729166666664 | 6.28 |
| 44695.739583333336 | 6.12 |
| 44695.75 | 5.26 |
| 44695.760416666664 | 6.34 |
| 44695.770833333336 | 6.5 |
| 44695.78125 | 5.34 |
| 44695.791666666664 | 4.53 |
| 44695.802083333336 | 4.35 |
| 44695.8125 | 3.94 |
| 44695.822916666664 | 3.4 |
| 44695.833333333336 | 3.34 |
| 44695.84375 | 3.17 |
| 44695.854166666664 | 2.7 |
| 44695.864583333336 | 2.51 |
| 44695.875 | 2.38 |
| 44695.885416666664 | 2.24 |
| 44695.895833333336 | 2.17 |
| 44695.90625 | 2.14 |
| 44695.916666666664 | 2.26 |
| 44695.927083333336 | 2.22 |
| 44695.9375 | 2.15 |
| 44695.947916666664 | 2.22 |
| 44695.958333333336 | 2.25 |
| 44695.96875 | 2.45 |
| 44695.979166666664 | 2.36 |
| 44695.989583333336 | 2.42 |
| 44696.0 | 2.64 |
| 44696.010416666664 | 2.55 |
| 44696.020833333336 | 2.42 |
| 44696.03125 | 2.79 |
| 44696.041666666664 | 2.42 |
| 44696.052083333336 | 2.43 |
| 44696.0625 | 2.36 |
| 44696.072916666664 | 2.03 |
| 44696.083333333336 | 1.78 |
| 44696.09375 | 2.06 |
| 44696.104166666664 | 1.98 |
| 44696.114583333336 | 1.95 |
| 44696.125 | 1.89 |
| 44696.135416666664 | 1.95 |
| 44696.145833333336 | 2.08 |
| 44696.15625 | 2.12 |
| 44696.166666666664 | 2.32 |
| 44696.177083333336 | 2.34 |
| 44696.1875 | 2.29 |
| 44696.197916666664 | 2.65 |
| 44696.208333333336 | 2.87 |
| 44696.21875 | 3.05 |
| 44696.229166666664 | 3.17 |
| 44696.239583333336 | 3.25 |
| 44696.25 | 3.19 |
| 44696.260416666664 | 3.29 |
| 44696.270833333336 | 3.23 |
| 44696.28125 | 3.67 |
| 44696.291666666664 | 4.43 |
| 44696.302083333336 | 3.6 |
| 44696.3125 | 3.62 |
| 44696.322916666664 | 3.37 |
| 44696.333333333336 | 3.46 |
| 44696.34375 | 3.31 |
| 44696.354166666664 | 2.99 |
| 44696.364583333336 | 2.72 |
| 44696.375 | 2.6 |
| 44696.385416666664 | 2.35 |
| 44696.395833333336 | 2.27 |
| 44696.40625 | 2.15 |
| 44696.416666666664 | 1.98 |
| 44696.427083333336 | 1.95 |
| 44696.4375 | 1.94 |
| 44696.447916666664 | 1.8 |
| 44696.458333333336 | 1.63 |
| 44696.46875 | 1.95 |
| 44696.479166666664 | 1.83 |
| 44696.489583333336 | 1.59 |
| 44696.5 | 1.54 |
| 44696.510416666664 | 1.65 |
| 44696.520833333336 | 1.48 |
| 44696.53125 | 1.46 |
| 44696.541666666664 | 1.41 |
| 44696.552083333336 | 1.47 |
| 44696.5625 | 1.42 |
| 44696.572916666664 | 1.17 |
| 44696.583333333336 | 1.32 |
| 44696.59375 | 1.65 |
| 44696.604166666664 | 1.59 |
| 44696.614583333336 | 1.79 |
| 44696.625 | 1.66 |
| 44696.635416666664 | 1.72 |
| 44696.645833333336 | 1.84 |
| 44696.65625 | 1.74 |
| 44696.666666666664 | 1.81 |
| 44696.677083333336 | 1.99 |
| 44696.6875 | 2.27 |
| 44696.697916666664 | 2.5 |
| 44696.708333333336 | 2.84 |
| 44696.71875 | 2.99 |
| 44696.729166666664 | 3.18 |
| 44696.739583333336 | 3.81 |
| 44696.75 | 4.37 |
| 44696.760416666664 | 5.18 |
| 44696.770833333336 | 5.04 |
| 44696.78125 | 5.25 |
| 44696.791666666664 | 5.34 |
| 44696.802083333336 | 5.21 |
| 44696.8125 | 5.32 |
| 44696.822916666664 | 5.12 |
| 44696.833333333336 | 4.64 |
| 44696.84375 | 4.11 |
| 44696.854166666664 | 3.72 |
| 44696.864583333336 | 3.51 |
| 44696.875 | 3.41 |
| 44696.885416666664 | 3.18 |
| 44696.895833333336 | 3.14 |
| 44696.90625 | 2.84 |
| 44696.916666666664 | 2.79 |
| 44696.927083333336 | 2.69 |
| 44696.9375 | 2.52 |
| 44696.947916666664 | 2.5 |
| 44696.958333333336 | 2.36 |
| 44696.96875 | 2.28 |
| 44696.979166666664 | 2.46 |
| 44696.989583333336 | 2.5 |
| 44697.0 | 2.3 |
| 44697.010416666664 | 2.7 |
| 44697.020833333336 | 2.8 |
| 44697.03125 | 2.88 |
| 44697.041666666664 | 2.65 |
| 44697.052083333336 | 2.88 |
| 44697.0625 | 2.73 |
| 44697.072916666664 | 2.49 |
| 44697.083333333336 | 2.72 |
| 44697.09375 | 2.17 |
| 44697.104166666664 | 2.29 |
| 44697.114583333336 | 2.27 |
| 44697.125 | 2.45 |
| 44697.135416666664 | 2.32 |
| 44697.145833333336 | 2.24 |
| 44697.15625 | 1.98 |
| 44697.166666666664 | 2.04 |
| 44697.177083333336 | 1.99 |
| 44697.1875 | 2.06 |
| 44697.197916666664 | 2.28 |
| 44697.208333333336 | 2.35 |
| 44697.21875 | 2.49 |
| 44697.229166666664 | 2.62 |
| 44697.239583333336 | 2.85 |
| 44697.25 | 2.77 |
| 44697.260416666664 | 3.23 |
| 44697.270833333336 | 3.46 |
| 44697.28125 | 3.69 |
| 44697.291666666664 | 3.81 |
| 44697.302083333336 | 3.84 |
| 44697.3125 | 3.76 |
| 44697.322916666664 | 4.48 |
| 44697.333333333336 | 4.26 |
| 44697.34375 | 4.5 |
| 44697.354166666664 | 3.99 |
| 44697.364583333336 | 3.95 |
| 44697.375 | 3.86 |
| 44697.385416666664 | 3.33 |
| 44697.395833333336 | 3.11 |
| 44697.40625 | 2.79 |
| 44697.416666666664 | 2.68 |
| 44697.427083333336 | 2.39 |
| 44697.4375 | 2.22 |
| 44697.447916666664 | 2.21 |
| 44697.458333333336 | 2 |
| 44697.46875 | 2 |
| 44697.479166666664 | 2.02 |
| 44697.489583333336 | 1.97 |
| 44697.5 | 2.04 |
| 44697.510416666664 | 2.1 |
| 44697.520833333336 | 1.91 |
| 44697.53125 | 1.93 |
| 44697.541666666664 | 1.8 |
| 44697.552083333336 | 1.7 |
| 44697.5625 | 1.9 |
| 44697.572916666664 | 1.54 |
| 44697.583333333336 | 1.57 |
| 44697.59375 | 1.52 |
| 44697.604166666664 | 1.89 |
| 44697.614583333336 | 2.25 |
| 44697.625 | 1.45 |
| 44697.635416666664 | 1.88 |
| 44697.645833333336 | 2.06 |
| 44697.65625 | 1.89 |
| 44697.666666666664 | 1.93 |
| 44697.677083333336 | 1.82 |
| 44697.6875 | 2.01 |
| 44697.697916666664 | 2.24 |
| 44697.708333333336 | 2.4 |
| 44697.71875 | 2.34 |
| 44697.729166666664 | 2.68 |
| 44697.739583333336 | 3.3 |
| 44697.75 | 3.52 |
| 44697.760416666664 | 4.04 |
| 44697.770833333336 | 4.5 |
| 44697.78125 | 4.68 |
| 44697.791666666664 | 5.02 |
| 44697.802083333336 | 4.92 |
| 44697.8125 | 5.88 |
| 44697.822916666664 | 7.41 |
| 44697.833333333336 | 7.58 |
| 44697.84375 | 6.5 |
| 44697.854166666664 | 5.59 |
| 44697.864583333336 | 5.7 |
| 44697.875 | 4.78 |
| 44697.885416666664 | 4.35 |
| 44697.895833333336 | 4.24 |
| 44697.90625 | 3.98 |
| 44697.916666666664 | 4.13 |
| 44697.927083333336 | 4.19 |
| 44697.9375 | 3.9 |
| 44697.947916666664 | 3.76 |
| 44697.958333333336 | 3.59 |
| 44697.96875 | 3.68 |
| 44697.979166666664 | 3.49 |
| 44697.989583333336 | 3.43 |
| 44698.0 | 3.65 |
| 44698.010416666664 | 3.48 |
| 44698.020833333336 | 3.22 |
| 44698.03125 | 3.4 |
| 44698.041666666664 | 3.69 |
| 44698.052083333336 | 3.57 |
| 44698.0625 | 3.4 |
| 44698.072916666664 | 3.27 |
| 44698.083333333336 | 3.32 |
| 44698.09375 | 3.5 |
| 44698.104166666664 | 3.62 |
| 44698.114583333336 | 3 |
| 44698.125 | 3.14 |
| 44698.135416666664 | 2.7 |
| 44698.145833333336 | 2.88 |
| 44698.15625 | 3.12 |
| 44698.166666666664 | 2.85 |
| 44698.177083333336 | 2.86 |
| 44698.1875 | 2.92 |
| 44698.197916666664 | 2.86 |
| 44698.208333333336 | 2.71 |
| 44698.21875 | 2.79 |
| 44698.229166666664 | 2.87 |
| 44698.239583333336 | 2.84 |
| 44698.25 | 3.17 |
| 44698.260416666664 | 3.19 |
| 44698.270833333336 | 3.7 |
| 44698.28125 | 3.92 |
| 44698.291666666664 | 3.89 |
| 44698.302083333336 | 3.96 |
| 44698.3125 | 3.87 |
| 44698.322916666664 | 4.07 |
| 44698.333333333336 | 4.26 |
| 44698.34375 | 4.6 |
| 44698.354166666664 | 5.07 |
| 44698.364583333336 | 5.63 |
| 44698.375 | 5.19 |
| 44698.385416666664 | 4.82 |
| 44698.395833333336 | 4.57 |
| 44698.40625 | 4.56 |
| 44698.416666666664 | 4.19 |
| 44698.427083333336 | 3.79 |
| 44698.4375 | 3.17 |
| 44698.447916666664 | 2.89 |
| 44698.458333333336 | 2.75 |
| 44698.46875 | 2.63 |
| 44698.479166666664 | 2.46 |
| 44698.489583333336 | 2.4 |
| 44698.5 | 2.29 |
| 44698.510416666664 | 2.39 |
| 44698.520833333336 | 2.58 |
| 44698.53125 | 2.39 |
| 44698.541666666664 | 2.35 |
| 44698.552083333336 | 2.19 |
| 44698.5625 | 2.02 |
| 44698.572916666664 | 2.02 |
| 44698.583333333336 | 2.15 |
| 44698.59375 | 2.07 |
| 44698.604166666664 | 2.38 |
| 44698.614583333336 | 2.49 |
| 44698.625 | 2.74 |
| 44698.635416666664 | 2.47 |
| 44698.645833333336 | 1.96 |
| 44698.65625 | 2.23 |
| 44698.666666666664 | 2.14 |
| 44698.677083333336 | 2.27 |
| 44698.6875 | 2.42 |
| 44698.697916666664 | 2.53 |
| 44698.708333333336 | 2.54 |
| 44698.71875 | 2.61 |
| 44698.729166666664 | 2.82 |
| 44698.739583333336 | 2.81 |
| 44698.75 | 2.96 |
| 44698.760416666664 | 3.28 |
| 44698.770833333336 | 3.73 |
| 44698.78125 | 4.11 |
| 44698.791666666664 | 4.57 |
| 44698.802083333336 | 5.22 |
| 44698.8125 | 5.96 |
| 44698.822916666664 | 6.59 |
| 44698.833333333336 | 7.63 |
| 44698.84375 | 8.16 |
| 44698.854166666664 | 8.35 |
| 44698.864583333336 | 8.51 |
| 44698.875 | 7.03 |
| 44698.885416666664 | 6.01 |
| 44698.895833333336 | 5.47 |
| 44698.90625 | 4.92 |
| 44698.916666666664 | 4.24 |
| 44698.927083333336 | 4.33 |
| 44698.9375 | 4.15 |
| 44698.947916666664 | 3.96 |
| 44698.958333333336 | 3.32 |
| 44698.96875 | 3.27 |
| 44698.979166666664 | 3.1 |
| 44698.989583333336 | 3.23 |
| 44699.0 | 3.25 |
| 44699.010416666664 | 3.22 |
| 44699.020833333336 | 3.37 |
| 44699.03125 | 3.61 |
| 44699.041666666664 | 3.36 |
| 44699.052083333336 | 3.39 |
| 44699.0625 | 3.32 |
| 44699.072916666664 | 3.28 |
| 44699.083333333336 | 3.33 |
| 44699.09375 | 3.45 |
| 44699.104166666664 | 3.58 |
| 44699.114583333336 | 3.42 |
| 44699.125 | 3.29 |
| 44699.135416666664 | 3.41 |
| 44699.145833333336 | 2.94 |
| 44699.15625 | 3.31 |
| 44699.166666666664 | 2.89 |
| 44699.177083333336 | 2.78 |
| 44699.1875 | 2.75 |
| 44699.197916666664 | 2.73 |
| 44699.208333333336 | 2.82 |
| 44699.21875 | 2.72 |
| 44699.229166666664 | 2.4 |
| 44699.239583333336 | 2.42 |
| 44699.25 | 2.56 |
| 44699.260416666664 | 2.72 |
| 44699.270833333336 | 2.57 |
| 44699.28125 | 2.68 |
| 44699.291666666664 | 2.87 |
| 44699.302083333336 | 3.24 |
| 44699.3125 | 3.42 |
| 44699.322916666664 | 3.42 |
| 44699.333333333336 | 3.34 |
| 44699.34375 | 3.62 |
| 44699.354166666664 | 3.81 |
| 44699.364583333336 | 3.64 |
| 44699.375 | 3.58 |
| 44699.385416666664 | 3.83 |
| 44699.395833333336 | 4.32 |
| 44699.40625 | 3.65 |
| 44699.416666666664 | 3.76 |
| 44699.427083333336 | 3.49 |
| 44699.4375 | 3.28 |
| 44699.447916666664 | 3.2 |
| 44699.458333333336 | 3.14 |
| 44699.46875 | 2.8 |
| 44699.479166666664 | 2.62 |
| 44699.489583333336 | 2.59 |
| 44699.5 | 2.39 |
| 44699.510416666664 | 2.38 |
| 44699.520833333336 | 2.36 |
| 44699.53125 | 2.03 |
| 44699.541666666664 | 1.97 |
| 44699.552083333336 | 2.1 |
| 44699.5625 | 2.07 |
| 44699.572916666664 | 1.89 |
| 44699.583333333336 | 2.1 |
| 44699.59375 | 2.02 |
| 44699.604166666664 | 1.91 |
| 44699.614583333336 | 2.04 |
| 44699.625 | 1.75 |
| 44699.635416666664 | 1.81 |
| 44699.645833333336 | 1.83 |
| 44699.65625 | 1.94 |
| 44699.666666666664 | 1.96 |
| 44699.677083333336 | 1.93 |
| 44699.6875 | 1.94 |
| 44699.697916666664 | 2.04 |
| 44699.708333333336 | 2.05 |
| 44699.71875 | 2.13 |
| 44699.729166666664 | 1.94 |
| 44699.739583333336 | 2.14 |
| 44699.75 | 2.07 |
| 44699.760416666664 | 2.31 |
| 44699.770833333336 | 2.58 |
| 44699.78125 | 2.74 |
| 44699.791666666664 | 3 |
| 44699.802083333336 | 3.91 |
| 44699.8125 | 4.25 |
| 44699.822916666664 | 4.92 |
| 44699.833333333336 | 5.59 |
| 44699.84375 | 5.8 |
| 44699.854166666664 | 6.13 |
| 44699.864583333336 | 7.25 |
| 44699.875 | 7.88 |
| 44699.885416666664 | 8.03 |
| 44699.895833333336 | 9.05 |
| 44699.90625 | 8.89 |
| 44699.916666666664 | 7.67 |
| 44699.927083333336 | 6.2 |
| 44699.9375 | 5.73 |
| 44699.947916666664 | 5.25 |
| 44699.958333333336 | 4.42 |
| 44699.96875 | 4.03 |
| 44699.979166666664 | 4.45 |
| 44699.989583333336 | 4.07 |
| 44700.0 | 4.16 |
| 44700.010416666664 | 4.51 |
| 44700.020833333336 | 4.45 |
| 44700.03125 | 4.36 |
| 44700.041666666664 | 3.87 |
| 44700.052083333336 | 3.52 |
| 44700.0625 | 3.31 |
| 44700.072916666664 | 3.15 |
| 44700.083333333336 | 3.03 |
| 44700.09375 | 2.88 |
| 44700.104166666664 | 2.77 |
| 44700.114583333336 | 2.81 |
| 44700.125 | 2.88 |
| 44700.135416666664 | 2.95 |
| 44700.145833333336 | 2.83 |
| 44700.15625 | 2.76 |
| 44700.166666666664 | 2.67 |
| 44700.177083333336 | 2.49 |
| 44700.1875 | 2.58 |
| 44700.197916666664 | 2.73 |
| 44700.208333333336 | 2.55 |
| 44700.21875 | 2.46 |
| 44700.229166666664 | 2.66 |
| 44700.239583333336 | 2.62 |
| 44700.25 | 2.46 |
| 44700.260416666664 | 2.59 |
| 44700.270833333336 | 2.42 |
| 44700.28125 | 2.29 |
| 44700.291666666664 | 2.61 |
| 44700.302083333336 | 2.57 |
| 44700.3125 | 2.55 |
| 44700.322916666664 | 2.58 |
| 44700.333333333336 | 2.62 |
| 44700.34375 | 2.8 |
| 44700.354166666664 | 2.98 |
| 44700.364583333336 | 3.25 |
| 44700.375 | 3.51 |
| 44700.385416666664 | 3.34 |
| 44700.395833333336 | 3.84 |
| 44700.40625 | 4.03 |
| 44700.416666666664 | 3.99 |
| 44700.427083333336 | 4.19 |
| 44700.4375 | 3.93 |
| 44700.447916666664 | 3.7 |
| 44700.458333333336 | 3.72 |
| 44700.46875 | 3.6 |
| 44700.479166666664 | 3.37 |
| 44700.489583333336 | 3.3 |
| 44700.5 | 3.23 |
| 44700.510416666664 | 3.03 |
| 44700.520833333336 | 2.96 |
| 44700.53125 | 2.95 |
| 44700.541666666664 | 2.94 |
| 44700.552083333336 | 2.84 |
| 44700.5625 | 2.77 |
| 44700.572916666664 | 2.85 |
| 44700.583333333336 | 2.79 |
| 44700.59375 | 2.62 |
| 44700.604166666664 | 2.61 |
| 44700.614583333336 | 2.72 |
| 44700.625 | 2.82 |
| 44700.635416666664 | 2.81 |
| 44700.645833333336 | 2.85 |
| 44700.65625 | 2.59 |
| 44700.666666666664 | 2.44 |
| 44700.677083333336 | 2.81 |
| 44700.6875 | 2.78 |
| 44700.697916666664 | 2.96 |
| 44700.708333333336 | 2.94 |
| 44700.71875 | 2.85 |
| 44700.729166666664 | 2.97 |
| 44700.739583333336 | 2.89 |
| 44700.75 | 3.11 |
| 44700.760416666664 | 3.32 |
| 44700.770833333336 | 2.96 |
| 44700.78125 | 3.16 |
| 44700.791666666664 | 3.17 |
| 44700.802083333336 | 3.29 |
| 44700.8125 | 3.52 |
| 44700.822916666664 | 3.62 |
| 44700.833333333336 | 3.99 |
| 44700.84375 | 4.22 |
| 44700.854166666664 | 3.99 |
| 44700.864583333336 | 4.83 |
| 44700.875 | 5 |
| 44700.885416666664 | 5.29 |
| 44700.895833333336 | 5.68 |
| 44700.90625 | 5.87 |
| 44700.916666666664 | 6.11 |
| 44700.927083333336 | 7.3 |
| 44700.9375 | 6.91 |
| 44700.947916666664 | 6.28 |
| 44700.958333333336 | 4.84 |
| 44700.96875 | 5 |
| 44700.979166666664 | 4.6 |
| 44700.989583333336 | 4.07 |
| 44701.0 | 4.24 |
| 44701.010416666664 | 3.8 |
| 44701.020833333336 | 4 |
| 44701.03125 | 3.46 |
| 44701.041666666664 | 3.02 |
| 44701.052083333336 | 3.24 |
| 44701.0625 | 3.1 |
| 44701.072916666664 | 2.74 |
| 44701.083333333336 | 2.75 |
| 44701.09375 | 2.7 |
| 44701.104166666664 | 2.71 |
| 44701.114583333336 | 2.7 |
| 44701.125 | 2.89 |
| 44701.135416666664 | 2.88 |
| 44701.145833333336 | 2.76 |
| 44701.15625 | 3.06 |
| 44701.166666666664 | 2.98 |
| 44701.177083333336 | 3.19 |
| 44701.1875 | 3.3 |
| 44701.197916666664 | 3.29 |
| 44701.208333333336 | 3.28 |
| 44701.21875 | 2.89 |
| 44701.229166666664 | 2.7 |
| 44701.239583333336 | 2.41 |
| 44701.25 | 2.51 |
| 44701.260416666664 | 2.44 |
| 44701.270833333336 | 2.65 |
| 44701.28125 | 2.47 |
| 44701.291666666664 | 2.56 |
| 44701.302083333336 | 2.55 |
| 44701.3125 | 2.43 |
| 44701.322916666664 | 2.43 |
| 44701.333333333336 | 2.29 |
| 44701.34375 | 2.43 |
| 44701.354166666664 | 2.49 |
| 44701.364583333336 | 2.52 |
| 44701.375 | 2.75 |
| 44701.385416666664 | 2.98 |
| 44701.395833333336 | 3.19 |
| 44701.40625 | 3.05 |
| 44701.416666666664 | 3.18 |
| 44701.427083333336 | 3.25 |
| 44701.4375 | 3.62 |
| 44701.447916666664 | 3.56 |
| 44701.458333333336 | 3.71 |
| 44701.46875 | 4.53 |
| 44701.479166666664 | 4.91 |
| 44701.489583333336 | 4.57 |
| 44701.5 | 3.76 |
| 44701.510416666664 | 3.75 |
| 44701.520833333336 | 3.33 |
| 44701.53125 | 3.12 |
| 44701.541666666664 | 3 |
| 44701.552083333336 | 3 |
| 44701.5625 | 2.66 |
| 44701.572916666664 | 2.53 |
| 44701.583333333336 | 2.65 |
| 44701.59375 | 2.66 |
| 44701.604166666664 | 2.69 |
| 44701.614583333336 | 2.62 |
| 44701.625 | 2.23 |
| 44701.635416666664 | 2.34 |
| 44701.645833333336 | 2.48 |
| 44701.65625 | 2.42 |
| 44701.666666666664 | 2.25 |
| 44701.677083333336 | 2.49 |
| 44701.6875 | 2.17 |
| 44701.697916666664 | 2.55 |
| 44701.708333333336 | 2.35 |
| 44701.71875 | 2.77 |
| 44701.729166666664 | 2.14 |
| 44701.739583333336 | 2.49 |
| 44701.75 | 2.41 |
| 44701.760416666664 | 2.34 |
| 44701.770833333336 | 2.22 |
| 44701.78125 | 2.89 |
| 44701.791666666664 | 2.24 |
| 44701.802083333336 | 2.38 |
| 44701.8125 | 2.35 |
| 44701.822916666664 | 2.8 |
| 44701.833333333336 | 2.99 |
| 44701.84375 | 3.41 |
| 44701.854166666664 | 2.84 |
| 44701.864583333336 | 3.42 |
| 44701.875 | 3.55 |
| 44701.885416666664 | 3.76 |
| 44701.895833333336 | 3.94 |
| 44701.90625 | 4.49 |
| 44701.916666666664 | 4.18 |
| 44701.927083333336 | 4.15 |
| 44701.9375 | 4.21 |
| 44701.947916666664 | 4.5 |
| 44701.958333333336 | 4.68 |
| 44701.96875 | 5.28 |
| 44701.979166666664 | 4.97 |
| 44701.989583333336 | 4.95 |
| 44702.0 | 4.31 |
| 44702.010416666664 | 3.59 |
| 44702.020833333336 | 3.96 |
| 44702.03125 | 4.24 |
| 44702.041666666664 | 4.36 |
| 44702.052083333336 | 4.27 |
| 44702.0625 | 4.36 |
| 44702.072916666664 | 4.56 |
| 44702.083333333336 | 4.49 |
| 44702.09375 | 4.23 |
| 44702.104166666664 | 4.09 |
| 44702.114583333336 | 3.98 |
| 44702.125 | 3.66 |
| 44702.135416666664 | 3.84 |
| 44702.145833333336 | 3.39 |
| 44702.15625 | 3.36 |
| 44702.166666666664 | 3.11 |
| 44702.177083333336 | 2.93 |
| 44702.1875 | 2.81 |
| 44702.197916666664 | 3.31 |
| 44702.208333333336 | 2.84 |
| 44702.21875 | 3.09 |
| 44702.229166666664 | 3.11 |
| 44702.239583333336 | 2.67 |
| 44702.25 | 2.45 |
| 44702.260416666664 | 2.85 |
| 44702.270833333336 | 2.43 |
| 44702.28125 | 2.68 |
| 44702.291666666664 | 2.53 |
| 44702.302083333336 | 2.88 |
| 44702.3125 | 2.81 |
| 44702.322916666664 | 2.49 |
| 44702.333333333336 | 2.55 |
| 44702.34375 | 2.34 |
| 44702.354166666664 | 2.25 |
| 44702.364583333336 | 2.45 |
| 44702.375 | 2.59 |
| 44702.385416666664 | 2.56 |
| 44702.395833333336 | 2.89 |
| 44702.40625 | 2.75 |
| 44702.416666666664 | 2.84 |
| 44702.427083333336 | 3.08 |
| 44702.4375 | 3.18 |
| 44702.447916666664 | 3.29 |
| 44702.458333333336 | 3.82 |
| 44702.46875 | 3.9 |
| 44702.479166666664 | 4.42 |
| 44702.489583333336 | 4.82 |
| 44702.5 | 5.15 |
| 44702.510416666664 | 5.42 |
| 44702.520833333336 | 5.18 |
| 44702.53125 | 4.42 |
| 44702.541666666664 | 3.57 |
| 44702.552083333336 | 3.16 |
| 44702.5625 | 2.98 |
| 44702.572916666664 | 2.85 |
| 44702.583333333336 | 2.92 |
| 44702.59375 | 2.96 |
| 44702.604166666664 | 2.86 |
| 44702.614583333336 | 2.77 |
| 44702.625 | 2.67 |
| 44702.635416666664 | 2.45 |
| 44702.645833333336 | 2.66 |
| 44702.65625 | 2.48 |
| 44702.666666666664 | 2.32 |
| 44702.677083333336 | 2.45 |
| 44702.6875 | 2.32 |
| 44702.697916666664 | 2.49 |
| 44702.708333333336 | 2.3 |
| 44702.71875 | 2.36 |
| 44702.729166666664 | 2.18 |
| 44702.739583333336 | 2.8 |
| 44702.75 | 2.33 |
| 44702.760416666664 | 3.8 |
| 44702.770833333336 | 3.56 |
| 44702.78125 | 3.41 |
| 44702.791666666664 | 3.36 |
| 44702.802083333336 | 4.91 |
| 44702.8125 | 3.25 |
| 44702.822916666664 | 3.12 |
| 44702.833333333336 | 4.36 |
| 44702.84375 | 2.9 |
| 44702.854166666664 | 3.14 |
| 44702.864583333336 | 3.04 |
| 44702.875 | 3.07 |
| 44702.885416666664 | 3.6 |
| 44702.895833333336 | 3.45 |
| 44702.90625 | 4 |
| 44702.916666666664 | 4 |
| 44702.927083333336 | 3.89 |
| 44702.9375 | 3.49 |
| 44702.947916666664 | 3.59 |
| 44702.958333333336 | 3.49 |
| 44702.96875 | 3.11 |
| 44702.979166666664 | 3.04 |
| 44702.989583333336 | 3.05 |
| 44703.0 | 3.15 |
| 44703.010416666664 | 3.46 |
| 44703.020833333336 | 4.13 |
| 44703.03125 | 3.61 |
| 44703.041666666664 | 3.28 |
| 44703.052083333336 | 3.03 |
| 44703.0625 | 3.44 |
| 44703.072916666664 | 3.5 |
| 44703.083333333336 | 3.52 |
| 44703.09375 | 3.69 |
| 44703.104166666664 | 4.23 |
| 44703.114583333336 | 4.24 |
| 44703.125 | 3.96 |
| 44703.135416666664 | 3.6 |
| 44703.145833333336 | 3.55 |
| 44703.15625 | 3.49 |
| 44703.166666666664 | 3.48 |
| 44703.177083333336 | 3.4 |
| 44703.1875 | 3.59 |
| 44703.197916666664 | 3.34 |
| 44703.208333333336 | 3.53 |
| 44703.21875 | 3.51 |
| 44703.229166666664 | 3.45 |
| 44703.239583333336 | 3.49 |
| 44703.25 | 3.68 |
| 44703.260416666664 | 4.25 |
| 44703.270833333336 | 3.88 |
| 44703.28125 | 3.86 |
| 44703.291666666664 | 3.36 |
| 44703.302083333336 | 3.08 |
| 44703.3125 | 2.97 |
| 44703.322916666664 | 2.69 |
| 44703.333333333336 | 2.98 |
| 44703.34375 | 3.14 |
| 44703.354166666664 | 2.74 |
| 44703.364583333336 | 2.54 |
| 44703.375 | 2.55 |
| 44703.385416666664 | 2.41 |
| 44703.395833333336 | 2.59 |
| 44703.40625 | 2.7 |
| 44703.416666666664 | 2.7 |
| 44703.427083333336 | 2.81 |
| 44703.4375 | 2.61 |
| 44703.447916666664 | 3.03 |
| 44703.458333333336 | 3.04 |
| 44703.46875 | 3.26 |
| 44703.479166666664 | 3.71 |
| 44703.489583333336 | 4.51 |
| 44703.5 | 4.98 |
| 44703.510416666664 | 5.73 |
| 44703.520833333336 | 6.7 |
| 44703.53125 | 7.4 |
| 44703.541666666664 | 7.94 |
| 44703.552083333336 | 7.9 |
| 44703.5625 | 7.42 |
| 44703.572916666664 | 6.24 |
| 44703.583333333336 | 5.02 |
| 44703.59375 | 4.08 |
| 44703.604166666664 | 3.95 |
| 44703.614583333336 | 3.63 |
| 44703.625 | 3.26 |
| 44703.635416666664 | 3.23 |
| 44703.645833333336 | 3.21 |
| 44703.65625 | 3 |
| 44703.666666666664 | 2.9 |
| 44703.677083333336 | 3 |
| 44703.6875 | 2.94 |
| 44703.697916666664 | 2.94 |
| 44703.708333333336 | 3.25 |
| 44703.71875 | 2.87 |
| 44703.729166666664 | 2.93 |
| 44703.739583333336 | 3.13 |
| 44703.75 | 2.87 |
| 44703.760416666664 | 3.2 |
| 44703.770833333336 | 3.07 |
| 44703.78125 | 4.09 |
| 44703.791666666664 | 4.84 |
| 44703.802083333336 | 5.69 |
| 44703.8125 | 4.28 |
| 44703.822916666664 | 4.37 |
| 44703.833333333336 | 3.84 |
| 44703.84375 | 3.33 |
| 44703.854166666664 | 3 |
| 44703.864583333336 | 4.97 |
| 44703.875 | 3.71 |
| 44703.885416666664 | 3.74 |
| 44703.895833333336 | 4.33 |
| 44703.90625 | 3.78 |
| 44703.916666666664 | 3.64 |
| 44703.927083333336 | 3.41 |
| 44703.9375 | 3.59 |
| 44703.947916666664 | 3.15 |
| 44703.958333333336 | 2.89 |
| 44703.96875 | 2.71 |
| 44703.979166666664 | 2.8 |
| 44703.989583333336 | 2.66 |
| 44704.0 | 2.5 |
| 44704.010416666664 | 2.7 |
| 44704.020833333336 | 2.5 |
| 44704.03125 | 2.54 |
| 44704.041666666664 | 2.59 |
| 44704.052083333336 | 2.96 |
| 44704.0625 | 2.76 |
| 44704.072916666664 | 2.66 |
| 44704.083333333336 | 2.62 |
| 44704.09375 | 2.91 |
| 44704.104166666664 | 2.53 |
| 44704.114583333336 | 2.43 |
| 44704.125 | 2.64 |
| 44704.135416666664 | 2.95 |
| 44704.145833333336 | 3.18 |
| 44704.15625 | 2.89 |
| 44704.166666666664 | 2.77 |
| 44704.177083333336 | 3.03 |
| 44704.1875 | 2.75 |
| 44704.197916666664 | 2.8 |
| 44704.208333333336 | 2.68 |
| 44704.21875 | 2.84 |
| 44704.229166666664 | 3.03 |
| 44704.239583333336 | 3.18 |
| 44704.25 | 3.18 |
| 44704.260416666664 | 3.18 |
| 44704.270833333336 | 3.12 |
| 44704.28125 | 3.2 |
| 44704.291666666664 | 3.22 |
| 44704.302083333336 | 3.18 |
| 44704.3125 | 3.62 |
| 44704.322916666664 | 3.55 |
| 44704.333333333336 | 2.97 |
| 44704.34375 | 3.43 |
| 44704.354166666664 | 3.32 |
| 44704.364583333336 | 3 |
| 44704.375 | 2.95 |
| 44704.385416666664 | 2.87 |
| 44704.395833333336 | 2.54 |
| 44704.40625 | 2.68 |
| 44704.416666666664 | 2.49 |
| 44704.427083333336 | 2.28 |
| 44704.4375 | 2.08 |
| 44704.447916666664 | 2.05 |
| 44704.458333333336 | 2.5 |
| 44704.46875 | 2.57 |
| 44704.479166666664 | 2.73 |
| 44704.489583333336 | 3.42 |
| 44704.5 | 3.47 |
| 44704.510416666664 | 4.55 |
| 44704.520833333336 | 5.34 |
| 44704.53125 | 6.65 |
| 44704.541666666664 | 7.87 |
| 44704.552083333336 | 9.36 |
| 44704.5625 | 10.38 |
| 44704.572916666664 | 11.81 |
| 44704.583333333336 | 12.1 |
| 44704.59375 | 12.42 |
| 44704.604166666664 | 11.76 |
| 44704.614583333336 | 10.27 |
| 44704.625 | 8.31 |
| 44704.635416666664 | 6.36 |
| 44704.645833333336 | 5.86 |
| 44704.65625 | 4.78 |
| 44704.666666666664 | 4.01 |
| 44704.677083333336 | 3.57 |
| 44704.6875 | 3.79 |
| 44704.697916666664 | 3.52 |
| 44704.708333333336 | 3.43 |
| 44704.71875 | 2.98 |
| 44704.729166666664 | 2.95 |
| 44704.739583333336 | 2.92 |
| 44704.75 | 2.94 |
| 44704.760416666664 | 3.2 |
| 44704.770833333336 | 3.45 |
| 44704.78125 | 3.62 |
| 44704.791666666664 | 3.49 |
| 44704.802083333336 | 3.78 |
| 44704.8125 | 3.58 |
| 44704.822916666664 | 3.62 |
| 44704.833333333336 | 3.23 |
| 44704.84375 | 3.25 |
| 44704.854166666664 | 3.49 |
| 44704.864583333336 | 4.23 |
| 44704.875 | 3.38 |
| 44704.885416666664 | 3.62 |
| 44704.895833333336 | 3.45 |
| 44704.90625 | 3.65 |
| 44704.916666666664 | 3.78 |
| 44704.927083333336 | 3.88 |
| 44704.9375 | 3.42 |
| 44704.947916666664 | 3.55 |
| 44704.958333333336 | 3.61 |
| 44704.96875 | 4.53 |
| 44704.979166666664 | 4.86 |
| 44704.989583333336 | 4.56 |
| 44705.0 | 4.64 |
| 44705.010416666664 | 4.4 |
| 44705.020833333336 | 4.44 |
| 44705.03125 | 4.31 |
| 44705.041666666664 | 4.26 |
| 44705.052083333336 | 4.07 |
| 44705.0625 | 3.78 |
| 44705.072916666664 | 3.69 |
| 44705.083333333336 | 3.64 |
| 44705.09375 | 3.48 |
| 44705.104166666664 | 3.56 |
| 44705.114583333336 | 3.52 |
| 44705.125 | 3.69 |
| 44705.135416666664 | 4.27 |
| 44705.145833333336 | 3.85 |
| 44705.15625 | 4.03 |
| 44705.166666666664 | 3.95 |
| 44705.177083333336 | 3.89 |
| 44705.1875 | 3.45 |
| 44705.197916666664 | 3.41 |
| 44705.208333333336 | 3.48 |
| 44705.21875 | 3.64 |
| 44705.229166666664 | 3.64 |
| 44705.239583333336 | 3.09 |
| 44705.25 | 3.14 |
| 44705.260416666664 | 2.77 |
| 44705.270833333336 | 2.73 |
| 44705.28125 | 2.95 |
| 44705.291666666664 | 3.23 |
| 44705.302083333336 | 3.54 |
| 44705.3125 | 3.43 |
| 44705.322916666664 | 3.44 |
| 44705.333333333336 | 3.35 |
| 44705.34375 | 3.08 |
| 44705.354166666664 | 2.34 |
| 44705.364583333336 | 2.28 |
| 44705.375 | 2.41 |
| 44705.385416666664 | 2.48 |
| 44705.395833333336 | 2.4 |
| 44705.40625 | 2.53 |
| 44705.416666666664 | 2.25 |
| 44705.427083333336 | 1.9 |
| 44705.4375 | 2.2 |
| 44705.447916666664 | 2.26 |
| 44705.458333333336 | 1.97 |
| 44705.46875 | 2.2 |
| 44705.479166666664 | 2.48 |
| 44705.489583333336 | 2.71 |
| 44705.5 | 3.03 |
| 44705.510416666664 | 3.22 |
| 44705.520833333336 | 3.42 |
| 44705.53125 | 3.59 |
| 44705.541666666664 | 4.24 |
| 44705.552083333336 | 4.81 |
| 44705.5625 | 5.43 |
| 44705.572916666664 | 6.09 |
| 44705.583333333336 | 6.22 |
| 44705.59375 | 6.84 |
| 44705.604166666664 | 7.99 |
| 44705.614583333336 | 8.11 |
| 44705.625 | 8.87 |
| 44705.635416666664 | 9.13 |
| 44705.645833333336 | 9.33 |
| 44705.65625 | 8.2 |
| 44705.666666666664 | 8.38 |
| 44705.677083333336 | 7.64 |
| 44705.6875 | 6.6 |
| 44705.697916666664 | 5.91 |
| 44705.708333333336 | 5.46 |
| 44705.71875 | 4.91 |
| 44705.729166666664 | 3.96 |
| 44705.739583333336 | 4.04 |
| 44705.75 | 3.8 |
| 44705.760416666664 | 3.68 |
| 44705.770833333336 | 3.64 |
| 44705.78125 | 3.56 |
| 44705.791666666664 | 3.34 |
| 44705.802083333336 | 3.44 |
| 44705.8125 | 3.21 |
| 44705.822916666664 | 3.41 |
| 44705.833333333336 | 3.22 |
| 44705.84375 | 3.19 |
| 44705.854166666664 | 3.07 |
| 44705.864583333336 | 3.14 |
| 44705.875 | 2.97 |
| 44705.885416666664 | 2.82 |
| 44705.895833333336 | 3.17 |
| 44705.90625 | 2.94 |
| 44705.916666666664 | 2.95 |
| 44705.927083333336 | 3.14 |
| 44705.9375 | 3.05 |
| 44705.947916666664 | 2.79 |
| 44705.958333333336 | 3.18 |
| 44705.96875 | 3.13 |
| 44705.979166666664 | 3.08 |
| 44705.989583333336 | 2.92 |
| 44706.0 | 3.14 |
| 44706.010416666664 | 3.02 |
| 44706.020833333336 | 3.05 |
| 44706.03125 | 3.21 |
| 44706.041666666664 | 3.02 |
| 44706.052083333336 | 2.95 |
| 44706.0625 | 3.01 |
| 44706.072916666664 | 2.85 |
| 44706.083333333336 | 2.95 |
| 44706.09375 | 3.06 |
| 44706.104166666664 | 3.25 |
| 44706.114583333336 | 3.33 |
| 44706.125 | 3.69 |
| 44706.135416666664 | 3.51 |
| 44706.145833333336 | 3.59 |
| 44706.15625 | 3.7 |
| 44706.166666666664 | 3.71 |
| 44706.177083333336 | 3.8 |
| 44706.1875 | 3.6 |
| 44706.197916666664 | 3.55 |
| 44706.208333333336 | 3.72 |
| 44706.21875 | 3.8 |
| 44706.229166666664 | 3.8 |
| 44706.239583333336 | 3.71 |
| 44706.25 | 3.39 |
| 44706.260416666664 | 3.2 |
| 44706.270833333336 | 3.38 |
| 44706.28125 | 3.22 |
| 44706.291666666664 | 3.17 |
| 44706.302083333336 | 3.25 |
| 44706.3125 | 3.22 |
| 44706.322916666664 | 3.18 |
| 44706.333333333336 | 2.99 |
| 44706.34375 | 3.02 |
| 44706.354166666664 | 3.04 |
| 44706.364583333336 | 3.32 |
| 44706.375 | 2.95 |
| 44706.385416666664 | 3.12 |
| 44706.395833333336 | 2.74 |
| 44706.40625 | 2.48 |
| 44706.416666666664 | 2.44 |
| 44706.427083333336 | 2.16 |
| 44706.4375 | 1.98 |
| 44706.447916666664 | 1.96 |
| 44706.458333333336 | 2.05 |
| 44706.46875 | 1.83 |
| 44706.479166666664 | 1.97 |
| 44706.489583333336 | 1.81 |
| 44706.5 | 1.93 |
| 44706.510416666664 | 1.94 |
| 44706.520833333336 | 2.21 |
| 44706.53125 | 2.15 |
| 44706.541666666664 | 2.39 |
| 44706.552083333336 | 2.78 |
| 44706.5625 | 2.89 |
| 44706.572916666664 | 3.44 |
| 44706.583333333336 | 3.69 |
| 44706.59375 | 4.01 |
| 44706.604166666664 | 4.88 |
| 44706.614583333336 | 5.46 |
| 44706.625 | 5.67 |
| 44706.635416666664 | 5.61 |
| 44706.645833333336 | 5.51 |
| 44706.65625 | 5.49 |
| 44706.666666666664 | 4.95 |
| 44706.677083333336 | 5.3 |
| 44706.6875 | 5.3 |
| 44706.697916666664 | 5.4 |
| 44706.708333333336 | 5.37 |
| 44706.71875 | 5.67 |
| 44706.729166666664 | 5.32 |
| 44706.739583333336 | 5.32 |
| 44706.75 | 4.88 |
| 44706.760416666664 | 4.24 |
| 44706.770833333336 | 4.09 |
| 44706.78125 | 4.06 |
| 44706.791666666664 | 3.6 |
| 44706.802083333336 | 3.69 |
| 44706.8125 | 3.39 |
| 44706.822916666664 | 3.35 |
| 44706.833333333336 | 3.59 |
| 44706.84375 | 3.28 |
| 44706.854166666664 | 3.36 |
| 44706.864583333336 | 3.28 |
| 44706.875 | 2.96 |
| 44706.885416666664 | 2.96 |
| 44706.895833333336 | 2.81 |
| 44706.90625 | 2.51 |
| 44706.916666666664 | 2.39 |
| 44706.927083333336 | 2.45 |
| 44706.9375 | 2.6 |
| 44706.947916666664 | 2.66 |
| 44706.958333333336 | 2.58 |
| 44706.96875 | 2.57 |
| 44706.979166666664 | 2.52 |
| 44706.989583333336 | 2.78 |
| 44707.0 | 2.52 |
| 44707.010416666664 | 2.51 |
| 44707.020833333336 | 2.61 |
| 44707.03125 | 2.67 |
| 44707.041666666664 | 2.85 |
| 44707.052083333336 | 2.68 |
| 44707.0625 | 2.68 |
| 44707.072916666664 | 2.53 |
| 44707.083333333336 | 2.65 |
| 44707.09375 | 2.42 |
| 44707.104166666664 | 2.49 |
| 44707.114583333336 | 2.76 |
| 44707.125 | 3.05 |
| 44707.135416666664 | 3.19 |
| 44707.145833333336 | 3.22 |
| 44707.15625 | 2.97 |
| 44707.166666666664 | 2.92 |
| 44707.177083333336 | 2.82 |
| 44707.1875 | 2.74 |
| 44707.197916666664 | 3.29 |
| 44707.208333333336 | 3.1 |
| 44707.21875 | 3.36 |
| 44707.229166666664 | 3.12 |
| 44707.239583333336 | 2.86 |
| 44707.25 | 3.15 |
| 44707.260416666664 | 3.05 |
| 44707.270833333336 | 3.06 |
| 44707.28125 | 2.89 |
| 44707.291666666664 | 2.81 |
| 44707.302083333336 | 2.43 |
| 44707.3125 | 2.41 |
| 44707.322916666664 | 2.56 |
| 44707.333333333336 | 2.18 |
| 44707.34375 | 2.18 |
| 44707.354166666664 | 2.06 |
| 44707.364583333336 | 2.05 |
| 44707.375 | 2.07 |
| 44707.385416666664 | 2 |
| 44707.395833333336 | 2.16 |
| 44707.40625 | 1.96 |
| 44707.416666666664 | 1.91 |
| 44707.427083333336 | 1.71 |
| 44707.4375 | 1.58 |
| 44707.447916666664 | 1.75 |
| 44707.458333333336 | 1.41 |
| 44707.46875 | 1.56 |
| 44707.479166666664 | 1.54 |
| 44707.489583333336 | 1.56 |
| 44707.5 | 1.45 |
| 44707.510416666664 | 1.49 |
| 44707.520833333336 | 1.54 |
| 44707.53125 | 1.55 |
| 44707.541666666664 | 1.67 |
| 44707.552083333336 | 1.73 |
| 44707.5625 | 1.87 |
| 44707.572916666664 | 2.05 |
| 44707.583333333336 | 2.45 |
| 44707.59375 | 2.65 |
| 44707.604166666664 | 2.81 |
| 44707.614583333336 | 2.89 |
| 44707.625 | 3.36 |
| 44707.635416666664 | 4.28 |
| 44707.645833333336 | 4.58 |
| 44707.65625 | 4.87 |
| 44707.666666666664 | 4.67 |
| 44707.677083333336 | 4.1 |
| 44707.6875 | 4.23 |
| 44707.697916666664 | 4.78 |
| 44707.708333333336 | 5.07 |
| 44707.71875 | 5.43 |
| 44707.729166666664 | 4.63 |
| 44707.739583333336 | 4.03 |
| 44707.75 | 4 |
| 44707.760416666664 | 3.52 |
| 44707.770833333336 | 3.52 |
| 44707.78125 | 3.29 |
| 44707.791666666664 | 2.95 |
| 44707.802083333336 | 2.89 |
| 44707.8125 | 2.8 |
| 44707.822916666664 | 2.72 |
| 44707.833333333336 | 2.39 |
| 44707.84375 | 2.35 |
| 44707.854166666664 | 2.25 |
| 44707.864583333336 | 2.37 |
| 44707.875 | 2.19 |
| 44707.885416666664 | 2.3 |
| 44707.895833333336 | 2.18 |
| 44707.90625 | 2.45 |
| 44707.916666666664 | 2.54 |
| 44707.927083333336 | 2.56 |
| 44707.9375 | 2.52 |
| 44707.947916666664 | 2.52 |
| 44707.958333333336 | 2.88 |
| 44707.96875 | 3.03 |
| 44707.979166666664 | 3.16 |
| 44707.989583333336 | 2.14 |
| 44708.0 | 2.24 |
| 44708.010416666664 | 2.26 |
| 44708.020833333336 | 2.5 |
| 44708.03125 | 2.6 |
| 44708.041666666664 | 2.46 |
| 44708.052083333336 | 2.47 |
| 44708.0625 | 2.33 |
| 44708.072916666664 | 2.37 |
| 44708.083333333336 | 2.19 |
| 44708.09375 | 1.96 |
| 44708.104166666664 | 1.96 |
| 44708.114583333336 | 1.91 |
| 44708.125 | 1.96 |
| 44708.135416666664 | 1.94 |
| 44708.145833333336 | 2.05 |
| 44708.15625 | 2.25 |
| 44708.166666666664 | 2.3 |
| 44708.177083333336 | 2.28 |
| 44708.1875 | 2.32 |
| 44708.197916666664 | 2.46 |
| 44708.208333333336 | 2.35 |
| 44708.21875 | 2.52 |
| 44708.229166666664 | 3.29 |
| 44708.239583333336 | 2.91 |
| 44708.25 | 3.17 |
| 44708.260416666664 | 2.96 |
| 44708.270833333336 | 2.93 |
| 44708.28125 | 2.72 |
| 44708.291666666664 | 2.82 |
| 44708.302083333336 | 2.37 |
| 44708.3125 | 2.39 |
| 44708.322916666664 | 2.12 |
| 44708.333333333336 | 2.05 |
| 44708.34375 | 2.13 |
| 44708.354166666664 | 1.92 |
| 44708.364583333336 | 2.01 |
| 44708.375 | 1.83 |
| 44708.385416666664 | 1.9 |
| 44708.395833333336 | 1.82 |
| 44708.40625 | 1.76 |
| 44708.416666666664 | 1.55 |
| 44708.427083333336 | 1.64 |
| 44708.4375 | 1.69 |
| 44708.447916666664 | 1.61 |
| 44708.458333333336 | 1.49 |
| 44708.46875 | 1.7 |
| 44708.479166666664 | 1.71 |
| 44708.489583333336 | 1.2 |
| 44708.5 | 1.21 |
| 44708.510416666664 | 1.09 |
| 44708.520833333336 | 1.21 |
| 44708.53125 | 1.52 |
| 44708.541666666664 | 1.73 |
| 44708.552083333336 | 1.53 |
| 44708.5625 | 1.43 |
| 44708.572916666664 | 1.55 |
| 44708.583333333336 | 1.72 |
| 44708.59375 | 1.72 |
| 44708.604166666664 | 1.65 |
| 44708.614583333336 | 1.74 |
| 44708.625 | 2.11 |
| 44708.635416666664 | 2.22 |
| 44708.645833333336 | 1.7 |
| 44708.65625 | 2.18 |
| 44708.666666666664 | 2.56 |
| 44708.677083333336 | 2.28 |
| 44708.6875 | 3.49 |
| 44708.697916666664 | 4.04 |
| 44708.708333333336 | 4.34 |
| 44708.71875 | 4.44 |
| 44708.729166666664 | 4.52 |
| 44708.739583333336 | 4.4 |
| 44708.75 | 4.4 |
| 44708.760416666664 | 3.76 |
| 44708.770833333336 | 2.81 |
| 44708.78125 | 3.04 |
| 44708.791666666664 | 2.85 |
| 44708.802083333336 | 2.81 |
| 44708.8125 | 2.76 |
| 44708.822916666664 | 2.81 |
| 44708.833333333336 | 3.02 |
| 44708.84375 | 3.43 |
| 44708.854166666664 | 3.22 |
| 44708.864583333336 | 3.47 |
| 44708.875 | 3.12 |
| 44708.885416666664 | 3.06 |
| 44708.895833333336 | 3.02 |
| 44708.90625 | 2.81 |
| 44708.916666666664 | 2.81 |
| 44708.927083333336 | 2.58 |
| 44708.9375 | 2.49 |
| 44708.947916666664 | 3.08 |
| 44708.958333333336 | 3.21 |
| 44708.96875 | 2.84 |
| 44708.979166666664 | 2.95 |
| 44708.989583333336 | 2.57 |
| 44709.0 | 2.61 |
| 44709.010416666664 | 2.72 |
| 44709.020833333336 | 2.29 |
| 44709.03125 | 2.17 |
| 44709.041666666664 | 2.78 |
| 44709.052083333336 | 3.09 |
| 44709.0625 | 3.22 |
| 44709.072916666664 | 2.52 |
| 44709.083333333336 | 2.69 |
| 44709.09375 | 2.24 |
| 44709.104166666664 | 2.32 |
| 44709.114583333336 | 2.32 |
| 44709.125 | 2.31 |
| 44709.135416666664 | 2.4 |
| 44709.145833333336 | 2.49 |
| 44709.15625 | 2.23 |
| 44709.166666666664 | 2.27 |
| 44709.177083333336 | 2.37 |
| 44709.1875 | 2.34 |
| 44709.197916666664 | 2.45 |
| 44709.208333333336 | 2.56 |
| 44709.21875 | 2.61 |
| 44709.229166666664 | 2.58 |
| 44709.239583333336 | 2.69 |
| 44709.25 | 2.72 |
| 44709.260416666664 | 2.79 |
| 44709.270833333336 | 3.52 |
| 44709.28125 | 4.05 |
| 44709.291666666664 | 3.41 |
| 44709.302083333336 | 3.35 |
| 44709.3125 | 2.87 |
| 44709.322916666664 | 2.77 |
| 44709.333333333336 | 2.67 |
| 44709.34375 | 2.77 |
| 44709.354166666664 | 2.62 |
| 44709.364583333336 | 2.52 |
| 44709.375 | 2.61 |
| 44709.385416666664 | 2.37 |
| 44709.395833333336 | 2.47 |
| 44709.40625 | 2.35 |
| 44709.416666666664 | 2.13 |
| 44709.427083333336 | 2.03 |
| 44709.4375 | 2.23 |
| 44709.447916666664 | 2.08 |
| 44709.458333333336 | 1.95 |
| 44709.46875 | 1.84 |
| 44709.479166666664 | 1.96 |
| 44709.489583333336 | 1.73 |
| 44709.5 | 1.74 |
| 44709.510416666664 | 1.68 |
| 44709.520833333336 | 1.74 |
| 44709.53125 | 1.89 |
| 44709.541666666664 | 1.78 |
| 44709.552083333336 | 1.37 |
| 44709.5625 | 1.96 |
| 44709.572916666664 | 1.82 |
| 44709.583333333336 | 1.61 |
| 44709.59375 | 1.79 |
| 44709.604166666664 | 1.65 |
| 44709.614583333336 | 1.87 |
| 44709.625 | 2.02 |
| 44709.635416666664 | 1.94 |
| 44709.645833333336 | 2.41 |
| 44709.65625 | 2.5 |
| 44709.666666666664 | 2.76 |
| 44709.677083333336 | 2.27 |
| 44709.6875 | 2.98 |
| 44709.697916666664 | 4.06 |
| 44709.708333333336 | 4.69 |
| 44709.71875 | 5.33 |
| 44709.729166666664 | 6.64 |
| 44709.739583333336 | 6.77 |
| 44709.75 | 8.94 |
| 44709.760416666664 | 11.94 |
| 44709.770833333336 | 10.57 |
| 44709.78125 | 6.68 |
| 44709.791666666664 | 6.79 |
| 44709.802083333336 | 6 |
| 44709.8125 | 4.34 |
| 44709.822916666664 | 3.85 |
| 44709.833333333336 | 3.5 |
| 44709.84375 | 3.13 |
| 44709.854166666664 | 3.18 |
| 44709.864583333336 | 3.04 |
| 44709.875 | 2.88 |
| 44709.885416666664 | 2.88 |
| 44709.895833333336 | 2.96 |
| 44709.90625 | 2.75 |
| 44709.916666666664 | 2.81 |
| 44709.927083333336 | 2.91 |
| 44709.9375 | 3.08 |
| 44709.947916666664 | 3.1 |
| 44709.958333333336 | 3.24 |
| 44709.96875 | 3.1 |
| 44709.979166666664 | 3.19 |
| 44709.989583333336 | 3.62 |
| 44710.0 | 3.69 |
| 44710.010416666664 | 4.11 |
| 44710.020833333336 | 3.85 |
| 44710.03125 | 4.2 |
| 44710.041666666664 | 3.83 |
| 44710.052083333336 | 3.26 |
| 44710.0625 | 3.98 |
| 44710.072916666664 | 3.53 |
| 44710.083333333336 | 3.65 |
| 44710.09375 | 3.08 |
| 44710.104166666664 | 3.05 |
| 44710.114583333336 | 2.67 |
| 44710.125 | 3.01 |
| 44710.135416666664 | 2.61 |
| 44710.145833333336 | 2.54 |
| 44710.15625 | 2.32 |
| 44710.166666666664 | 2.34 |
| 44710.177083333336 | 2.56 |
| 44710.1875 | 2.48 |
| 44710.197916666664 | 2.75 |
| 44710.208333333336 | 2.87 |
| 44710.21875 | 3.02 |
| 44710.229166666664 | 2.97 |
| 44710.239583333336 | 2.91 |
| 44710.25 | 3 |
| 44710.260416666664 | 2.9 |
| 44710.270833333336 | 3.05 |
| 44710.28125 | 3.5 |
| 44710.291666666664 | 4.06 |
| 44710.302083333336 | 3.93 |
| 44710.3125 | 3.62 |
| 44710.322916666664 | 3.4 |
| 44710.333333333336 | 3.23 |
| 44710.34375 | 3.16 |
| 44710.354166666664 | 3.06 |
| 44710.364583333336 | 3 |
| 44710.375 | 2.93 |
| 44710.385416666664 | 2.85 |
| 44710.395833333336 | 2.88 |
| 44710.40625 | 2.73 |
| 44710.416666666664 | 2.33 |
| 44710.427083333336 | 2.28 |
| 44710.4375 | 2.24 |
| 44710.447916666664 | 2.1 |
| 44710.458333333336 | 2.02 |
| 44710.46875 | 2.09 |
| 44710.479166666664 | 1.94 |
| 44710.489583333336 | 1.91 |
| 44710.5 | 1.72 |
| 44710.510416666664 | 1.84 |
| 44710.520833333336 | 1.78 |
| 44710.53125 | 1.8 |
| 44710.541666666664 | 1.6 |
| 44710.552083333336 | 1.98 |
| 44710.5625 | 2.41 |
| 44710.572916666664 | 1.94 |
| 44710.583333333336 | 2.25 |
| 44710.59375 | 2.33 |
| 44710.604166666664 | 2 |
| 44710.614583333336 | 2.21 |
| 44710.625 | 2.12 |
| 44710.635416666664 | 2.18 |
| 44710.645833333336 | 2.02 |
| 44710.65625 | 2.54 |
| 44710.666666666664 | 2.93 |
| 44710.677083333336 | 2.97 |
| 44710.6875 | 4.08 |
| 44710.697916666664 | 5.22 |
| 44710.708333333336 | 6.54 |
| 44710.71875 | 10.26 |
| 44710.729166666664 | 10.77 |
| 44710.739583333336 | 13.29 |
| 44710.75 | 14.89 |
| 44710.760416666664 | 16.88 |
| 44710.770833333336 | 19.14 |
| 44710.78125 | 20.59 |
| 44710.791666666664 | 22.41 |
| 44710.802083333336 | 22.19 |
| 44710.8125 | 20.84 |
| 44710.822916666664 | 18.89 |
| 44710.833333333336 | 15.76 |
| 44710.84375 | 11.5 |
| 44710.854166666664 | 9.11 |
| 44710.864583333336 | 8.03 |
| 44710.875 | 7.23 |
| 44710.885416666664 | 6.88 |
| 44710.895833333336 | 5.85 |
| 44710.90625 | 5.85 |
| 44710.916666666664 | 5.33 |
| 44710.927083333336 | 4.79 |
| 44710.9375 | 4.68 |
| 44710.947916666664 | 4.65 |
| 44710.958333333336 | 4.77 |
| 44710.96875 | 4.7 |
| 44710.979166666664 | 4.72 |
| 44710.989583333336 | 4.95 |
| 44711.0 | 5.77 |
| 44711.010416666664 | 5.78 |
| 44711.020833333336 | 6.02 |
| 44711.03125 | 6.8 |
| 44711.041666666664 | 7.35 |
| 44711.052083333336 | 6.9 |
| 44711.0625 | 6.75 |
| 44711.072916666664 | 6.17 |
| 44711.083333333336 | 5.16 |
| 44711.09375 | 5.08 |
| 44711.104166666664 | 5.02 |
| 44711.114583333336 | 4.65 |
| 44711.125 | 4.42 |
| 44711.135416666664 | 5.67 |
| 44711.145833333336 | 4.26 |
| 44711.15625 | 4.29 |
| 44711.166666666664 | 4.07 |
| 44711.177083333336 | 3.91 |
| 44711.1875 | 3.69 |
| 44711.197916666664 | 3.6 |
| 44711.208333333336 | 3.92 |
| 44711.21875 | 3.89 |
| 44711.229166666664 | 3.4 |
| 44711.239583333336 | 3.44 |
| 44711.25 | 3.58 |
| 44711.260416666664 | 3.74 |
| 44711.270833333336 | 3.89 |
| 44711.28125 | 3.65 |
| 44711.291666666664 | 3.68 |
| 44711.302083333336 | 3.83 |
| 44711.3125 | 4.07 |
| 44711.322916666664 | 5.04 |
| 44711.333333333336 | 4.96 |
| 44711.34375 | 4.61 |
| 44711.354166666664 | 4.29 |
| 44711.364583333336 | 4.27 |
| 44711.375 | 3.87 |
| 44711.385416666664 | 3.85 |
| 44711.395833333336 | 3.82 |
| 44711.40625 | 4.2 |
| 44711.416666666664 | 4.04 |
| 44711.427083333336 | 3.5 |
| 44711.4375 | 3.23 |
| 44711.447916666664 | 3.16 |
| 44711.458333333336 | 3.04 |
| 44711.46875 | 3.04 |
| 44711.479166666664 | 2.99 |
| 44711.489583333336 | 2.8 |
| 44711.5 | 2.78 |
| 44711.510416666664 | 2.8 |
| 44711.520833333336 | 2.73 |
| 44711.53125 | 2.75 |
| 44711.541666666664 | 2.71 |
| 44711.552083333336 | 2.59 |
| 44711.5625 | 2.61 |
| 44711.572916666664 | 3.19 |
| 44711.583333333336 | 2.84 |
| 44711.59375 | 2.97 |
| 44711.604166666664 | 2.4 |
| 44711.614583333336 | 2.2 |
| 44711.625 | 2.65 |
| 44711.635416666664 | 2.67 |
| 44711.645833333336 | 2.77 |
| 44711.65625 | 3.51 |
| 44711.666666666664 | 3.74 |
| 44711.677083333336 | 3.84 |
| 44711.6875 | 4.71 |
| 44711.697916666664 | 4.76 |
| 44711.708333333336 | 6.33 |
| 44711.71875 | 7.76 |
| 44711.729166666664 | 8.66 |
| 44711.739583333336 | 11.28 |
| 44711.75 | 12.29 |
| 44711.760416666664 | 13.93 |
| 44711.770833333336 | 15.89 |
| 44711.78125 | 18.69 |
| 44711.791666666664 | 20.42 |
| 44711.802083333336 | 22.38 |
| 44711.8125 | 23.69 |
| 44711.822916666664 | 20.86 |
| 44711.833333333336 | 21.81 |
| 44711.84375 | 21.32 |
| 44711.854166666664 | 18.28 |
| 44711.864583333336 | 14.97 |
| 44711.875 | 13.37 |
| 44711.885416666664 | 10.95 |
| 44711.895833333336 | 9.8 |
| 44711.90625 | 8.7 |
| 44711.916666666664 | 8.3 |
| 44711.927083333336 | 8.31 |
| 44711.9375 | 8.51 |
| 44711.947916666664 | 8.98 |
| 44711.958333333336 | 9.37 |
| 44711.96875 | 10.04 |
| 44711.979166666664 | 10.49 |
| 44711.989583333336 | 10.15 |
| 44712.0 | 11.79 |
| 44712.010416666664 | 12.41 |
| 44712.020833333336 | 12.59 |
| 44712.03125 | 11.8 |
| 44712.041666666664 | 10.87 |
| 44712.052083333336 | 11.26 |
| 44712.0625 | 10.55 |
| 44712.072916666664 | 12.91 |
| 44712.083333333336 | 10.71 |
| 44712.09375 | 8.41 |
| 44712.104166666664 | 9.13 |
| 44712.114583333336 | 8.88 |
| 44712.125 | 8.93 |
| 44712.135416666664 | 8.49 |
| 44712.145833333336 | 9.16 |
| 44712.15625 | 11.13 |
| 44712.166666666664 | 10.75 |
| 44712.177083333336 | 7.24 |
| 44712.1875 | 8.33 |
| 44712.197916666664 | 7.65 |
| 44712.208333333336 | 6.8 |
| 44712.21875 | 6.22 |
| 44712.229166666664 | 5.44 |
| 44712.239583333336 | 4.82 |
| 44712.25 | 4.3 |
| 44712.260416666664 | 4.13 |
| 44712.270833333336 | 3.83 |
| 44712.28125 | 3.84 |
| 44712.291666666664 | 3.77 |
| 44712.302083333336 | 3.8 |
| 44712.3125 | 3.41 |
| 44712.322916666664 | 3.35 |
| 44712.333333333336 | 3.51 |
| 44712.34375 | 3.73 |
| 44712.354166666664 | 4.37 |
| 44712.364583333336 | 3.89 |
| 44712.375 | 3.86 |
| 44712.385416666664 | 4.27 |
| 44712.395833333336 | 4.04 |
| 44712.40625 | 3.82 |
| 44712.416666666664 | 4.09 |
| 44712.427083333336 | 4.42 |
| 44712.4375 | 4.66 |
| 44712.447916666664 | 4.84 |
| 44712.458333333336 | 4.53 |
| 44712.46875 | 4.13 |
| 44712.479166666664 | 4.2 |
| 44712.489583333336 | 4.08 |
| 44712.5 | 4.13 |
| 44712.510416666664 | 4.11 |
| 44712.520833333336 | 4.12 |
| 44712.53125 | 4.15 |
| 44712.541666666664 | 4 |
| 44712.552083333336 | 3.97 |
| 44712.5625 | 4.24 |
| 44712.572916666664 | 4.14 |
| 44712.583333333336 | 3.96 |
| 44712.59375 | 4.12 |
| 44712.604166666664 | 4.24 |
| 44712.614583333336 | 4.1 |
| 44712.625 | 3.88 |
| 44712.635416666664 | 3.81 |
| 44712.645833333336 | 4.7 |
| 44712.65625 | 4.61 |
| 44712.666666666664 | 5.4 |
| 44712.677083333336 | 5.53 |
| 44712.6875 | 6.17 |
| 44712.697916666664 | 5.07 |
| 44712.708333333336 | 6 |
| 44712.71875 | 6.63 |
| 44712.729166666664 | 8.7 |
| 44712.739583333336 | 11.14 |
| 44712.75 | 13.92 |
| 44712.760416666664 | 16.07 |
| 44712.770833333336 | 18.17 |
| 44712.78125 | 19.69 |
| 44712.791666666664 | 21.67 |
| 44712.802083333336 | 21.28 |
| 44712.8125 | 21.57 |
| 44712.822916666664 | 23.21 |
| 44712.833333333336 | 23.29 |
| 44712.84375 | 23.75 |
| 44712.854166666664 | 19.61 |
| 44712.864583333336 | 19.39 |
| 44712.875 | 19.37 |
| 44712.885416666664 | 18.92 |
| 44712.895833333336 | 18.92 |
| 44712.90625 | 18.94 |
| 44712.916666666664 | 15.84 |
| 44712.927083333336 | 12.71 |
| 44712.9375 | 11.15 |
| 44712.947916666664 | 10.71 |
| 44712.958333333336 | 9.19 |
| 44712.96875 | 8.97 |
| 44712.979166666664 | 9.14 |
| 44712.989583333336 | 9.77 |
| 44713.0 | 11.26 |
| 44713.010416666664 | 11.98 |
| 44713.020833333336 | 13.96 |
| 44713.03125 | 13.8 |
| 44713.041666666664 | 13.68 |
| 44713.052083333336 | 13.22 |
| 44713.0625 | 13.11 |
| 44713.072916666664 | 12.24 |
| 44713.083333333336 | 12.97 |
| 44713.09375 | 12.71 |
| 44713.104166666664 | 12.71 |
| 44713.114583333336 | 12.19 |
| 44713.125 | 11.17 |
| 44713.135416666664 | 8.8 |
| 44713.145833333336 | 8.57 |
| 44713.15625 | 8.16 |